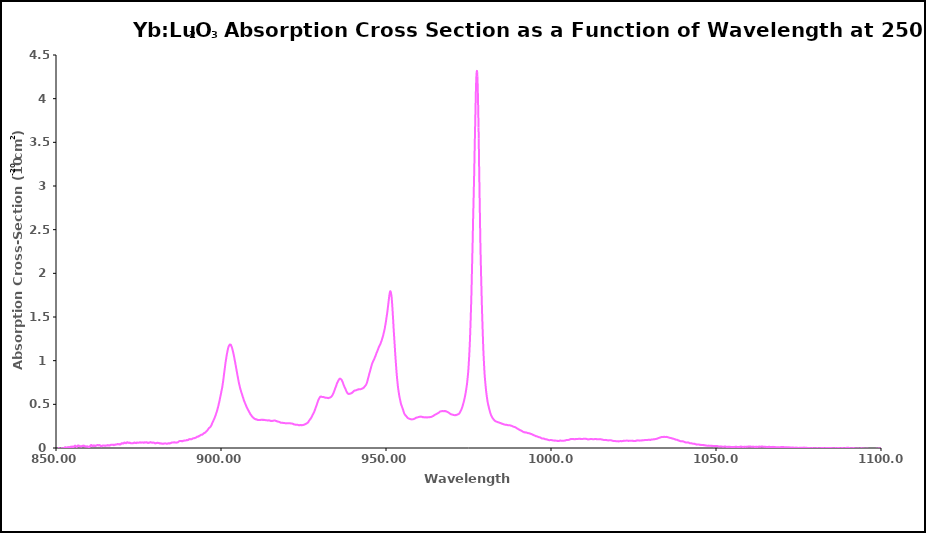
| Category | 250 K |
|---|---|
| 850.0 | -0.028 |
| 850.05 | -0.026 |
| 850.1 | -0.023 |
| 850.15 | -0.022 |
| 850.2 | -0.021 |
| 850.25 | -0.021 |
| 850.3 | -0.015 |
| 850.35 | -0.014 |
| 850.4 | -0.012 |
| 850.45 | -0.014 |
| 850.5 | -0.011 |
| 850.55 | -0.011 |
| 850.6 | -0.01 |
| 850.65 | -0.012 |
| 850.7 | -0.01 |
| 850.75 | -0.008 |
| 850.8 | -0.003 |
| 850.85 | -0.006 |
| 850.9 | -0.006 |
| 850.95 | -0.009 |
| 851.0 | -0.011 |
| 851.05 | -0.013 |
| 851.1 | -0.014 |
| 851.15 | -0.018 |
| 851.2 | -0.016 |
| 851.25 | -0.016 |
| 851.3 | -0.016 |
| 851.35 | -0.016 |
| 851.4 | -0.019 |
| 851.45 | -0.017 |
| 851.5 | -0.014 |
| 851.55 | -0.014 |
| 851.6 | -0.008 |
| 851.65 | -0.006 |
| 851.7 | -0.007 |
| 851.75 | -0.006 |
| 851.8 | -0.007 |
| 851.85 | -0.006 |
| 851.9 | -0.009 |
| 851.95 | -0.005 |
| 852.0 | -0.006 |
| 852.05 | -0.01 |
| 852.1 | -0.01 |
| 852.15 | -0.013 |
| 852.2 | -0.012 |
| 852.25 | -0.009 |
| 852.3 | -0.008 |
| 852.35 | -0.006 |
| 852.4 | -0.004 |
| 852.45 | -0.001 |
| 852.5 | -0.002 |
| 852.55 | -0.002 |
| 852.6 | 0.003 |
| 852.65 | 0.002 |
| 852.7 | 0.007 |
| 852.75 | 0.009 |
| 852.8 | 0.008 |
| 852.85 | 0.008 |
| 852.9 | 0.008 |
| 852.95 | 0.005 |
| 853.0 | 0.001 |
| 853.05 | -0.001 |
| 853.1 | 0.001 |
| 853.15 | 0 |
| 853.2 | 0.005 |
| 853.25 | 0.002 |
| 853.3 | -0.004 |
| 853.35 | -0.002 |
| 853.4 | 0 |
| 853.45 | -0.001 |
| 853.5 | 0 |
| 853.55 | 0.008 |
| 853.6 | 0.01 |
| 853.65 | 0.009 |
| 853.7 | 0.009 |
| 853.75 | 0.008 |
| 853.8 | 0.004 |
| 853.85 | 0.008 |
| 853.9 | 0.01 |
| 853.95 | 0.007 |
| 854.0 | 0.008 |
| 854.05 | 0.01 |
| 854.1 | 0.007 |
| 854.15 | 0.007 |
| 854.2 | 0.008 |
| 854.25 | 0.009 |
| 854.3 | 0.009 |
| 854.35 | 0.013 |
| 854.4 | 0.013 |
| 854.45 | 0.012 |
| 854.5 | 0.012 |
| 854.55 | 0.014 |
| 854.6 | 0.014 |
| 854.65 | 0.014 |
| 854.7 | 0.015 |
| 854.75 | 0.016 |
| 854.8 | 0.013 |
| 854.85 | 0.013 |
| 854.9 | 0.014 |
| 854.95 | 0.017 |
| 855.0 | 0.015 |
| 855.05 | 0.016 |
| 855.1 | 0.011 |
| 855.15 | 0.011 |
| 855.2 | 0.012 |
| 855.25 | 0.008 |
| 855.3 | 0.01 |
| 855.35 | 0.013 |
| 855.4 | 0.017 |
| 855.45 | 0.018 |
| 855.5 | 0.017 |
| 855.55 | 0.019 |
| 855.6 | 0.022 |
| 855.65 | 0.025 |
| 855.7 | 0.025 |
| 855.75 | 0.025 |
| 855.8 | 0.028 |
| 855.85 | 0.025 |
| 855.9 | 0.023 |
| 855.95 | 0.023 |
| 856.0 | 0.019 |
| 856.05 | 0.016 |
| 856.1 | 0.015 |
| 856.15 | 0.014 |
| 856.2 | 0.011 |
| 856.25 | 0.014 |
| 856.3 | 0.014 |
| 856.35 | 0.013 |
| 856.4 | 0.017 |
| 856.45 | 0.02 |
| 856.5 | 0.021 |
| 856.55 | 0.026 |
| 856.6 | 0.027 |
| 856.65 | 0.028 |
| 856.7 | 0.025 |
| 856.75 | 0.027 |
| 856.8 | 0.025 |
| 856.85 | 0.027 |
| 856.9 | 0.029 |
| 856.95 | 0.026 |
| 857.0 | 0.025 |
| 857.05 | 0.023 |
| 857.1 | 0.023 |
| 857.15 | 0.022 |
| 857.2 | 0.02 |
| 857.25 | 0.021 |
| 857.3 | 0.022 |
| 857.35 | 0.019 |
| 857.4 | 0.019 |
| 857.45 | 0.018 |
| 857.5 | 0.021 |
| 857.55 | 0.018 |
| 857.6 | 0.016 |
| 857.65 | 0.016 |
| 857.7 | 0.017 |
| 857.75 | 0.021 |
| 857.8 | 0.019 |
| 857.85 | 0.021 |
| 857.9 | 0.024 |
| 857.95 | 0.021 |
| 858.0 | 0.023 |
| 858.05 | 0.022 |
| 858.1 | 0.024 |
| 858.15 | 0.026 |
| 858.2 | 0.025 |
| 858.25 | 0.027 |
| 858.3 | 0.024 |
| 858.35 | 0.024 |
| 858.4 | 0.024 |
| 858.45 | 0.023 |
| 858.5 | 0.025 |
| 858.55 | 0.025 |
| 858.6 | 0.023 |
| 858.65 | 0.022 |
| 858.7 | 0.02 |
| 858.75 | 0.021 |
| 858.8 | 0.017 |
| 858.85 | 0.019 |
| 858.9 | 0.018 |
| 858.95 | 0.018 |
| 859.0 | 0.02 |
| 859.05 | 0.017 |
| 859.1 | 0.018 |
| 859.15 | 0.018 |
| 859.2 | 0.016 |
| 859.25 | 0.017 |
| 859.3 | 0.015 |
| 859.35 | 0.016 |
| 859.4 | 0.016 |
| 859.45 | 0.02 |
| 859.5 | 0.019 |
| 859.55 | 0.015 |
| 859.6 | 0.016 |
| 859.65 | 0.013 |
| 859.7 | 0.013 |
| 859.75 | 0.013 |
| 859.8 | 0.013 |
| 859.85 | 0.014 |
| 859.9 | 0.014 |
| 859.95 | 0.014 |
| 860.0 | 0.01 |
| 860.05 | 0.009 |
| 860.1 | 0.011 |
| 860.15 | 0.014 |
| 860.2 | 0.013 |
| 860.25 | 0.017 |
| 860.3 | 0.018 |
| 860.35 | 0.022 |
| 860.4 | 0.027 |
| 860.45 | 0.029 |
| 860.5 | 0.027 |
| 860.55 | 0.031 |
| 860.6 | 0.032 |
| 860.65 | 0.034 |
| 860.7 | 0.031 |
| 860.75 | 0.033 |
| 860.8 | 0.032 |
| 860.85 | 0.03 |
| 860.9 | 0.027 |
| 860.95 | 0.023 |
| 861.0 | 0.023 |
| 861.05 | 0.025 |
| 861.1 | 0.022 |
| 861.15 | 0.021 |
| 861.2 | 0.021 |
| 861.25 | 0.022 |
| 861.3 | 0.026 |
| 861.35 | 0.028 |
| 861.4 | 0.03 |
| 861.45 | 0.028 |
| 861.5 | 0.027 |
| 861.55 | 0.026 |
| 861.6 | 0.024 |
| 861.65 | 0.029 |
| 861.7 | 0.029 |
| 861.75 | 0.029 |
| 861.8 | 0.027 |
| 861.85 | 0.023 |
| 861.9 | 0.022 |
| 861.95 | 0.022 |
| 862.0 | 0.023 |
| 862.05 | 0.024 |
| 862.1 | 0.024 |
| 862.15 | 0.027 |
| 862.2 | 0.027 |
| 862.25 | 0.029 |
| 862.3 | 0.031 |
| 862.35 | 0.03 |
| 862.4 | 0.032 |
| 862.45 | 0.032 |
| 862.5 | 0.033 |
| 862.55 | 0.034 |
| 862.6 | 0.033 |
| 862.65 | 0.035 |
| 862.7 | 0.035 |
| 862.75 | 0.032 |
| 862.8 | 0.03 |
| 862.85 | 0.03 |
| 862.9 | 0.032 |
| 862.95 | 0.032 |
| 863.0 | 0.033 |
| 863.05 | 0.032 |
| 863.1 | 0.033 |
| 863.15 | 0.034 |
| 863.2 | 0.032 |
| 863.25 | 0.029 |
| 863.3 | 0.031 |
| 863.35 | 0.032 |
| 863.4 | 0.027 |
| 863.45 | 0.025 |
| 863.5 | 0.025 |
| 863.55 | 0.024 |
| 863.6 | 0.022 |
| 863.65 | 0.02 |
| 863.7 | 0.02 |
| 863.75 | 0.019 |
| 863.8 | 0.022 |
| 863.85 | 0.02 |
| 863.9 | 0.022 |
| 863.95 | 0.025 |
| 864.0 | 0.027 |
| 864.05 | 0.026 |
| 864.1 | 0.025 |
| 864.15 | 0.028 |
| 864.2 | 0.029 |
| 864.25 | 0.03 |
| 864.3 | 0.028 |
| 864.35 | 0.028 |
| 864.4 | 0.029 |
| 864.45 | 0.027 |
| 864.5 | 0.028 |
| 864.55 | 0.027 |
| 864.6 | 0.027 |
| 864.65 | 0.028 |
| 864.7 | 0.026 |
| 864.75 | 0.026 |
| 864.8 | 0.026 |
| 864.85 | 0.027 |
| 864.9 | 0.028 |
| 864.95 | 0.027 |
| 865.0 | 0.027 |
| 865.05 | 0.024 |
| 865.1 | 0.027 |
| 865.15 | 0.026 |
| 865.2 | 0.028 |
| 865.25 | 0.029 |
| 865.3 | 0.03 |
| 865.35 | 0.029 |
| 865.4 | 0.03 |
| 865.45 | 0.028 |
| 865.5 | 0.029 |
| 865.55 | 0.029 |
| 865.6 | 0.033 |
| 865.65 | 0.033 |
| 865.7 | 0.031 |
| 865.75 | 0.03 |
| 865.8 | 0.029 |
| 865.85 | 0.03 |
| 865.9 | 0.029 |
| 865.95 | 0.031 |
| 866.0 | 0.031 |
| 866.05 | 0.03 |
| 866.1 | 0.029 |
| 866.15 | 0.029 |
| 866.2 | 0.027 |
| 866.25 | 0.03 |
| 866.3 | 0.031 |
| 866.35 | 0.029 |
| 866.4 | 0.032 |
| 866.45 | 0.033 |
| 866.5 | 0.034 |
| 866.55 | 0.035 |
| 866.6 | 0.035 |
| 866.65 | 0.038 |
| 866.7 | 0.036 |
| 866.75 | 0.037 |
| 866.8 | 0.037 |
| 866.85 | 0.038 |
| 866.9 | 0.038 |
| 866.95 | 0.036 |
| 867.0 | 0.037 |
| 867.05 | 0.037 |
| 867.1 | 0.037 |
| 867.15 | 0.037 |
| 867.2 | 0.037 |
| 867.25 | 0.038 |
| 867.3 | 0.037 |
| 867.35 | 0.036 |
| 867.4 | 0.033 |
| 867.45 | 0.037 |
| 867.5 | 0.036 |
| 867.55 | 0.033 |
| 867.6 | 0.033 |
| 867.65 | 0.035 |
| 867.7 | 0.037 |
| 867.75 | 0.037 |
| 867.8 | 0.036 |
| 867.85 | 0.037 |
| 867.9 | 0.037 |
| 867.95 | 0.039 |
| 868.0 | 0.037 |
| 868.05 | 0.038 |
| 868.1 | 0.041 |
| 868.15 | 0.04 |
| 868.2 | 0.04 |
| 868.25 | 0.041 |
| 868.3 | 0.039 |
| 868.35 | 0.041 |
| 868.4 | 0.041 |
| 868.45 | 0.043 |
| 868.5 | 0.042 |
| 868.55 | 0.043 |
| 868.6 | 0.045 |
| 868.65 | 0.045 |
| 868.7 | 0.044 |
| 868.75 | 0.042 |
| 868.8 | 0.042 |
| 868.85 | 0.043 |
| 868.9 | 0.042 |
| 868.95 | 0.043 |
| 869.0 | 0.044 |
| 869.05 | 0.046 |
| 869.1 | 0.045 |
| 869.15 | 0.041 |
| 869.2 | 0.039 |
| 869.25 | 0.042 |
| 869.3 | 0.042 |
| 869.35 | 0.039 |
| 869.4 | 0.04 |
| 869.45 | 0.043 |
| 869.5 | 0.043 |
| 869.55 | 0.041 |
| 869.6 | 0.042 |
| 869.65 | 0.044 |
| 869.7 | 0.047 |
| 869.75 | 0.05 |
| 869.8 | 0.05 |
| 869.85 | 0.054 |
| 869.9 | 0.055 |
| 869.95 | 0.054 |
| 870.0 | 0.053 |
| 870.05 | 0.051 |
| 870.1 | 0.052 |
| 870.15 | 0.054 |
| 870.2 | 0.052 |
| 870.25 | 0.052 |
| 870.3 | 0.054 |
| 870.35 | 0.054 |
| 870.4 | 0.051 |
| 870.45 | 0.052 |
| 870.5 | 0.054 |
| 870.55 | 0.056 |
| 870.6 | 0.06 |
| 870.65 | 0.062 |
| 870.7 | 0.06 |
| 870.75 | 0.062 |
| 870.8 | 0.062 |
| 870.85 | 0.059 |
| 870.9 | 0.057 |
| 870.95 | 0.061 |
| 871.0 | 0.06 |
| 871.05 | 0.059 |
| 871.1 | 0.057 |
| 871.15 | 0.056 |
| 871.2 | 0.055 |
| 871.25 | 0.055 |
| 871.3 | 0.057 |
| 871.35 | 0.057 |
| 871.4 | 0.061 |
| 871.45 | 0.063 |
| 871.5 | 0.061 |
| 871.55 | 0.064 |
| 871.6 | 0.065 |
| 871.65 | 0.067 |
| 871.7 | 0.062 |
| 871.75 | 0.062 |
| 871.8 | 0.06 |
| 871.85 | 0.062 |
| 871.9 | 0.062 |
| 871.95 | 0.059 |
| 872.0 | 0.059 |
| 872.05 | 0.06 |
| 872.1 | 0.058 |
| 872.15 | 0.058 |
| 872.2 | 0.058 |
| 872.25 | 0.06 |
| 872.3 | 0.06 |
| 872.35 | 0.062 |
| 872.4 | 0.059 |
| 872.45 | 0.059 |
| 872.5 | 0.059 |
| 872.55 | 0.056 |
| 872.6 | 0.055 |
| 872.65 | 0.055 |
| 872.7 | 0.055 |
| 872.75 | 0.054 |
| 872.8 | 0.056 |
| 872.85 | 0.055 |
| 872.9 | 0.055 |
| 872.95 | 0.056 |
| 873.0 | 0.055 |
| 873.05 | 0.054 |
| 873.1 | 0.055 |
| 873.15 | 0.055 |
| 873.2 | 0.055 |
| 873.25 | 0.055 |
| 873.3 | 0.056 |
| 873.35 | 0.055 |
| 873.4 | 0.057 |
| 873.45 | 0.056 |
| 873.5 | 0.056 |
| 873.55 | 0.058 |
| 873.6 | 0.059 |
| 873.65 | 0.062 |
| 873.7 | 0.061 |
| 873.75 | 0.063 |
| 873.8 | 0.064 |
| 873.85 | 0.062 |
| 873.9 | 0.06 |
| 873.95 | 0.058 |
| 874.0 | 0.058 |
| 874.05 | 0.06 |
| 874.1 | 0.058 |
| 874.15 | 0.058 |
| 874.2 | 0.057 |
| 874.25 | 0.057 |
| 874.3 | 0.056 |
| 874.35 | 0.056 |
| 874.4 | 0.057 |
| 874.45 | 0.061 |
| 874.5 | 0.062 |
| 874.55 | 0.062 |
| 874.6 | 0.06 |
| 874.65 | 0.062 |
| 874.7 | 0.061 |
| 874.75 | 0.061 |
| 874.8 | 0.06 |
| 874.85 | 0.061 |
| 874.9 | 0.059 |
| 874.95 | 0.06 |
| 875.0 | 0.059 |
| 875.05 | 0.06 |
| 875.1 | 0.06 |
| 875.15 | 0.061 |
| 875.2 | 0.062 |
| 875.25 | 0.063 |
| 875.3 | 0.063 |
| 875.35 | 0.064 |
| 875.4 | 0.064 |
| 875.45 | 0.065 |
| 875.5 | 0.065 |
| 875.55 | 0.065 |
| 875.6 | 0.063 |
| 875.65 | 0.064 |
| 875.7 | 0.061 |
| 875.75 | 0.061 |
| 875.8 | 0.061 |
| 875.85 | 0.061 |
| 875.9 | 0.062 |
| 875.95 | 0.063 |
| 876.0 | 0.063 |
| 876.05 | 0.064 |
| 876.1 | 0.063 |
| 876.15 | 0.065 |
| 876.2 | 0.062 |
| 876.25 | 0.063 |
| 876.3 | 0.062 |
| 876.35 | 0.063 |
| 876.4 | 0.062 |
| 876.45 | 0.061 |
| 876.5 | 0.061 |
| 876.55 | 0.062 |
| 876.6 | 0.061 |
| 876.65 | 0.061 |
| 876.7 | 0.06 |
| 876.75 | 0.064 |
| 876.8 | 0.064 |
| 876.85 | 0.065 |
| 876.9 | 0.064 |
| 876.95 | 0.062 |
| 877.0 | 0.063 |
| 877.05 | 0.063 |
| 877.1 | 0.062 |
| 877.15 | 0.062 |
| 877.2 | 0.064 |
| 877.25 | 0.066 |
| 877.3 | 0.064 |
| 877.35 | 0.064 |
| 877.4 | 0.062 |
| 877.45 | 0.063 |
| 877.5 | 0.066 |
| 877.55 | 0.064 |
| 877.6 | 0.063 |
| 877.65 | 0.062 |
| 877.7 | 0.061 |
| 877.75 | 0.059 |
| 877.8 | 0.059 |
| 877.85 | 0.061 |
| 877.9 | 0.061 |
| 877.95 | 0.059 |
| 878.0 | 0.059 |
| 878.05 | 0.058 |
| 878.1 | 0.058 |
| 878.15 | 0.06 |
| 878.2 | 0.061 |
| 878.25 | 0.062 |
| 878.3 | 0.064 |
| 878.35 | 0.064 |
| 878.4 | 0.064 |
| 878.45 | 0.061 |
| 878.5 | 0.064 |
| 878.55 | 0.064 |
| 878.6 | 0.065 |
| 878.65 | 0.068 |
| 878.7 | 0.066 |
| 878.75 | 0.064 |
| 878.8 | 0.064 |
| 878.85 | 0.063 |
| 878.9 | 0.063 |
| 878.95 | 0.061 |
| 879.0 | 0.062 |
| 879.05 | 0.062 |
| 879.1 | 0.062 |
| 879.15 | 0.062 |
| 879.2 | 0.06 |
| 879.25 | 0.06 |
| 879.3 | 0.061 |
| 879.35 | 0.061 |
| 879.4 | 0.062 |
| 879.45 | 0.063 |
| 879.5 | 0.063 |
| 879.55 | 0.062 |
| 879.6 | 0.061 |
| 879.65 | 0.061 |
| 879.7 | 0.061 |
| 879.75 | 0.06 |
| 879.8 | 0.059 |
| 879.85 | 0.059 |
| 879.9 | 0.057 |
| 879.95 | 0.055 |
| 880.0 | 0.053 |
| 880.05 | 0.054 |
| 880.1 | 0.055 |
| 880.15 | 0.054 |
| 880.2 | 0.054 |
| 880.25 | 0.052 |
| 880.3 | 0.055 |
| 880.35 | 0.057 |
| 880.4 | 0.057 |
| 880.45 | 0.058 |
| 880.5 | 0.058 |
| 880.55 | 0.059 |
| 880.6 | 0.057 |
| 880.65 | 0.058 |
| 880.7 | 0.06 |
| 880.75 | 0.059 |
| 880.8 | 0.06 |
| 880.85 | 0.06 |
| 880.9 | 0.058 |
| 880.95 | 0.058 |
| 881.0 | 0.056 |
| 881.05 | 0.056 |
| 881.1 | 0.057 |
| 881.15 | 0.057 |
| 881.2 | 0.056 |
| 881.25 | 0.055 |
| 881.3 | 0.056 |
| 881.35 | 0.053 |
| 881.4 | 0.052 |
| 881.45 | 0.051 |
| 881.5 | 0.052 |
| 881.55 | 0.052 |
| 881.6 | 0.053 |
| 881.65 | 0.053 |
| 881.7 | 0.054 |
| 881.75 | 0.053 |
| 881.8 | 0.052 |
| 881.85 | 0.051 |
| 881.9 | 0.053 |
| 881.95 | 0.053 |
| 882.0 | 0.053 |
| 882.05 | 0.05 |
| 882.1 | 0.051 |
| 882.15 | 0.051 |
| 882.2 | 0.049 |
| 882.25 | 0.05 |
| 882.3 | 0.049 |
| 882.35 | 0.05 |
| 882.4 | 0.05 |
| 882.45 | 0.049 |
| 882.5 | 0.049 |
| 882.55 | 0.049 |
| 882.6 | 0.051 |
| 882.65 | 0.051 |
| 882.7 | 0.051 |
| 882.75 | 0.051 |
| 882.8 | 0.051 |
| 882.85 | 0.052 |
| 882.9 | 0.051 |
| 882.95 | 0.053 |
| 883.0 | 0.053 |
| 883.05 | 0.054 |
| 883.1 | 0.054 |
| 883.15 | 0.053 |
| 883.2 | 0.052 |
| 883.25 | 0.051 |
| 883.3 | 0.052 |
| 883.35 | 0.051 |
| 883.4 | 0.05 |
| 883.45 | 0.05 |
| 883.5 | 0.05 |
| 883.55 | 0.048 |
| 883.6 | 0.049 |
| 883.65 | 0.048 |
| 883.7 | 0.048 |
| 883.75 | 0.049 |
| 883.8 | 0.051 |
| 883.85 | 0.052 |
| 883.9 | 0.052 |
| 883.95 | 0.053 |
| 884.0 | 0.052 |
| 884.05 | 0.052 |
| 884.1 | 0.054 |
| 884.15 | 0.053 |
| 884.2 | 0.054 |
| 884.25 | 0.054 |
| 884.3 | 0.056 |
| 884.35 | 0.054 |
| 884.4 | 0.051 |
| 884.45 | 0.051 |
| 884.5 | 0.052 |
| 884.55 | 0.053 |
| 884.6 | 0.053 |
| 884.65 | 0.054 |
| 884.7 | 0.057 |
| 884.75 | 0.058 |
| 884.8 | 0.059 |
| 884.85 | 0.057 |
| 884.9 | 0.058 |
| 884.95 | 0.06 |
| 885.0 | 0.062 |
| 885.05 | 0.062 |
| 885.1 | 0.062 |
| 885.15 | 0.062 |
| 885.2 | 0.064 |
| 885.25 | 0.062 |
| 885.3 | 0.062 |
| 885.35 | 0.062 |
| 885.4 | 0.064 |
| 885.45 | 0.064 |
| 885.5 | 0.063 |
| 885.55 | 0.062 |
| 885.6 | 0.063 |
| 885.65 | 0.065 |
| 885.7 | 0.064 |
| 885.75 | 0.062 |
| 885.8 | 0.063 |
| 885.85 | 0.066 |
| 885.9 | 0.066 |
| 885.95 | 0.063 |
| 886.0 | 0.063 |
| 886.05 | 0.062 |
| 886.1 | 0.063 |
| 886.15 | 0.062 |
| 886.2 | 0.062 |
| 886.25 | 0.063 |
| 886.3 | 0.063 |
| 886.35 | 0.061 |
| 886.4 | 0.061 |
| 886.45 | 0.061 |
| 886.5 | 0.062 |
| 886.55 | 0.062 |
| 886.6 | 0.063 |
| 886.65 | 0.063 |
| 886.7 | 0.062 |
| 886.75 | 0.063 |
| 886.8 | 0.064 |
| 886.85 | 0.064 |
| 886.9 | 0.066 |
| 886.95 | 0.066 |
| 887.0 | 0.068 |
| 887.05 | 0.069 |
| 887.1 | 0.071 |
| 887.15 | 0.073 |
| 887.2 | 0.075 |
| 887.25 | 0.075 |
| 887.3 | 0.077 |
| 887.35 | 0.077 |
| 887.4 | 0.078 |
| 887.45 | 0.079 |
| 887.5 | 0.079 |
| 887.55 | 0.079 |
| 887.6 | 0.079 |
| 887.65 | 0.079 |
| 887.7 | 0.079 |
| 887.75 | 0.08 |
| 887.8 | 0.081 |
| 887.85 | 0.079 |
| 887.9 | 0.08 |
| 887.95 | 0.08 |
| 888.0 | 0.079 |
| 888.05 | 0.078 |
| 888.1 | 0.079 |
| 888.15 | 0.08 |
| 888.2 | 0.081 |
| 888.25 | 0.08 |
| 888.3 | 0.077 |
| 888.35 | 0.077 |
| 888.4 | 0.079 |
| 888.45 | 0.08 |
| 888.5 | 0.08 |
| 888.55 | 0.081 |
| 888.6 | 0.083 |
| 888.65 | 0.083 |
| 888.7 | 0.083 |
| 888.75 | 0.083 |
| 888.8 | 0.083 |
| 888.85 | 0.085 |
| 888.9 | 0.085 |
| 888.95 | 0.086 |
| 889.0 | 0.084 |
| 889.05 | 0.085 |
| 889.1 | 0.086 |
| 889.15 | 0.086 |
| 889.2 | 0.085 |
| 889.25 | 0.085 |
| 889.3 | 0.085 |
| 889.35 | 0.087 |
| 889.4 | 0.087 |
| 889.45 | 0.089 |
| 889.5 | 0.09 |
| 889.55 | 0.091 |
| 889.6 | 0.09 |
| 889.65 | 0.089 |
| 889.7 | 0.089 |
| 889.75 | 0.088 |
| 889.8 | 0.09 |
| 889.85 | 0.091 |
| 889.9 | 0.091 |
| 889.95 | 0.092 |
| 890.0 | 0.092 |
| 890.05 | 0.092 |
| 890.1 | 0.092 |
| 890.15 | 0.096 |
| 890.2 | 0.096 |
| 890.25 | 0.098 |
| 890.3 | 0.1 |
| 890.35 | 0.1 |
| 890.4 | 0.101 |
| 890.45 | 0.101 |
| 890.5 | 0.101 |
| 890.55 | 0.103 |
| 890.6 | 0.102 |
| 890.65 | 0.103 |
| 890.7 | 0.1 |
| 890.75 | 0.101 |
| 890.8 | 0.101 |
| 890.85 | 0.1 |
| 890.9 | 0.101 |
| 890.95 | 0.101 |
| 891.0 | 0.1 |
| 891.05 | 0.101 |
| 891.1 | 0.101 |
| 891.15 | 0.101 |
| 891.2 | 0.103 |
| 891.25 | 0.105 |
| 891.3 | 0.105 |
| 891.35 | 0.106 |
| 891.4 | 0.109 |
| 891.45 | 0.11 |
| 891.5 | 0.11 |
| 891.55 | 0.111 |
| 891.6 | 0.111 |
| 891.65 | 0.111 |
| 891.7 | 0.111 |
| 891.75 | 0.111 |
| 891.8 | 0.112 |
| 891.85 | 0.113 |
| 891.9 | 0.113 |
| 891.95 | 0.114 |
| 892.0 | 0.113 |
| 892.05 | 0.114 |
| 892.1 | 0.115 |
| 892.15 | 0.114 |
| 892.2 | 0.116 |
| 892.25 | 0.117 |
| 892.3 | 0.117 |
| 892.35 | 0.119 |
| 892.4 | 0.12 |
| 892.45 | 0.12 |
| 892.5 | 0.12 |
| 892.55 | 0.121 |
| 892.6 | 0.124 |
| 892.65 | 0.127 |
| 892.7 | 0.129 |
| 892.75 | 0.128 |
| 892.8 | 0.128 |
| 892.85 | 0.129 |
| 892.9 | 0.128 |
| 892.95 | 0.129 |
| 893.0 | 0.132 |
| 893.05 | 0.132 |
| 893.1 | 0.133 |
| 893.15 | 0.134 |
| 893.2 | 0.132 |
| 893.25 | 0.133 |
| 893.3 | 0.135 |
| 893.35 | 0.138 |
| 893.4 | 0.139 |
| 893.45 | 0.14 |
| 893.5 | 0.139 |
| 893.55 | 0.14 |
| 893.6 | 0.142 |
| 893.65 | 0.144 |
| 893.7 | 0.144 |
| 893.75 | 0.145 |
| 893.8 | 0.147 |
| 893.85 | 0.148 |
| 893.9 | 0.15 |
| 893.95 | 0.15 |
| 894.0 | 0.151 |
| 894.05 | 0.152 |
| 894.1 | 0.152 |
| 894.15 | 0.151 |
| 894.2 | 0.152 |
| 894.25 | 0.152 |
| 894.3 | 0.154 |
| 894.35 | 0.154 |
| 894.4 | 0.154 |
| 894.45 | 0.156 |
| 894.5 | 0.157 |
| 894.55 | 0.159 |
| 894.6 | 0.162 |
| 894.65 | 0.164 |
| 894.7 | 0.167 |
| 894.75 | 0.168 |
| 894.8 | 0.169 |
| 894.85 | 0.169 |
| 894.9 | 0.17 |
| 894.95 | 0.171 |
| 895.0 | 0.173 |
| 895.05 | 0.172 |
| 895.1 | 0.174 |
| 895.15 | 0.176 |
| 895.2 | 0.177 |
| 895.25 | 0.178 |
| 895.3 | 0.179 |
| 895.35 | 0.182 |
| 895.4 | 0.185 |
| 895.45 | 0.186 |
| 895.5 | 0.189 |
| 895.55 | 0.189 |
| 895.6 | 0.192 |
| 895.65 | 0.194 |
| 895.7 | 0.195 |
| 895.75 | 0.196 |
| 895.8 | 0.198 |
| 895.85 | 0.2 |
| 895.9 | 0.203 |
| 895.95 | 0.206 |
| 896.0 | 0.209 |
| 896.05 | 0.211 |
| 896.1 | 0.215 |
| 896.15 | 0.218 |
| 896.2 | 0.219 |
| 896.25 | 0.222 |
| 896.3 | 0.225 |
| 896.35 | 0.227 |
| 896.4 | 0.231 |
| 896.45 | 0.231 |
| 896.5 | 0.232 |
| 896.55 | 0.234 |
| 896.6 | 0.235 |
| 896.65 | 0.237 |
| 896.7 | 0.239 |
| 896.75 | 0.24 |
| 896.8 | 0.243 |
| 896.85 | 0.245 |
| 896.9 | 0.248 |
| 896.95 | 0.251 |
| 897.0 | 0.255 |
| 897.05 | 0.258 |
| 897.1 | 0.262 |
| 897.15 | 0.266 |
| 897.2 | 0.271 |
| 897.25 | 0.277 |
| 897.3 | 0.282 |
| 897.35 | 0.285 |
| 897.4 | 0.289 |
| 897.45 | 0.294 |
| 897.5 | 0.298 |
| 897.55 | 0.301 |
| 897.6 | 0.305 |
| 897.65 | 0.31 |
| 897.7 | 0.315 |
| 897.75 | 0.319 |
| 897.8 | 0.322 |
| 897.85 | 0.325 |
| 897.9 | 0.331 |
| 897.95 | 0.336 |
| 898.0 | 0.339 |
| 898.05 | 0.343 |
| 898.1 | 0.349 |
| 898.15 | 0.353 |
| 898.2 | 0.359 |
| 898.25 | 0.363 |
| 898.3 | 0.368 |
| 898.35 | 0.373 |
| 898.4 | 0.378 |
| 898.45 | 0.384 |
| 898.5 | 0.39 |
| 898.55 | 0.396 |
| 898.6 | 0.402 |
| 898.65 | 0.408 |
| 898.7 | 0.415 |
| 898.75 | 0.419 |
| 898.8 | 0.426 |
| 898.85 | 0.432 |
| 898.9 | 0.44 |
| 898.95 | 0.447 |
| 899.0 | 0.454 |
| 899.05 | 0.46 |
| 899.1 | 0.467 |
| 899.15 | 0.475 |
| 899.2 | 0.483 |
| 899.25 | 0.491 |
| 899.3 | 0.501 |
| 899.35 | 0.51 |
| 899.4 | 0.516 |
| 899.45 | 0.523 |
| 899.5 | 0.532 |
| 899.55 | 0.539 |
| 899.6 | 0.548 |
| 899.65 | 0.56 |
| 899.7 | 0.569 |
| 899.75 | 0.58 |
| 899.8 | 0.588 |
| 899.85 | 0.596 |
| 899.9 | 0.605 |
| 899.95 | 0.615 |
| 900.0 | 0.625 |
| 900.05 | 0.634 |
| 900.1 | 0.645 |
| 900.15 | 0.653 |
| 900.2 | 0.662 |
| 900.25 | 0.671 |
| 900.3 | 0.68 |
| 900.35 | 0.691 |
| 900.4 | 0.701 |
| 900.45 | 0.714 |
| 900.5 | 0.727 |
| 900.55 | 0.739 |
| 900.6 | 0.751 |
| 900.65 | 0.765 |
| 900.7 | 0.78 |
| 900.75 | 0.795 |
| 900.8 | 0.808 |
| 900.85 | 0.824 |
| 900.9 | 0.84 |
| 900.95 | 0.855 |
| 901.0 | 0.869 |
| 901.05 | 0.884 |
| 901.1 | 0.898 |
| 901.15 | 0.911 |
| 901.2 | 0.927 |
| 901.25 | 0.941 |
| 901.3 | 0.957 |
| 901.35 | 0.972 |
| 901.4 | 0.984 |
| 901.45 | 0.996 |
| 901.5 | 1.008 |
| 901.55 | 1.02 |
| 901.6 | 1.031 |
| 901.65 | 1.044 |
| 901.7 | 1.056 |
| 901.75 | 1.067 |
| 901.8 | 1.077 |
| 901.85 | 1.087 |
| 901.9 | 1.096 |
| 901.95 | 1.106 |
| 902.0 | 1.116 |
| 902.05 | 1.126 |
| 902.1 | 1.133 |
| 902.15 | 1.141 |
| 902.2 | 1.148 |
| 902.25 | 1.155 |
| 902.3 | 1.161 |
| 902.35 | 1.165 |
| 902.4 | 1.168 |
| 902.45 | 1.172 |
| 902.5 | 1.174 |
| 902.55 | 1.177 |
| 902.6 | 1.181 |
| 902.65 | 1.184 |
| 902.7 | 1.184 |
| 902.75 | 1.185 |
| 902.8 | 1.182 |
| 902.85 | 1.182 |
| 902.9 | 1.184 |
| 902.95 | 1.182 |
| 903.0 | 1.179 |
| 903.05 | 1.177 |
| 903.1 | 1.172 |
| 903.15 | 1.167 |
| 903.2 | 1.162 |
| 903.25 | 1.158 |
| 903.3 | 1.152 |
| 903.35 | 1.146 |
| 903.4 | 1.139 |
| 903.45 | 1.131 |
| 903.5 | 1.124 |
| 903.55 | 1.118 |
| 903.6 | 1.109 |
| 903.65 | 1.102 |
| 903.7 | 1.093 |
| 903.75 | 1.084 |
| 903.8 | 1.075 |
| 903.85 | 1.067 |
| 903.9 | 1.059 |
| 903.95 | 1.049 |
| 904.0 | 1.039 |
| 904.05 | 1.029 |
| 904.1 | 1.018 |
| 904.15 | 1.009 |
| 904.2 | 0.999 |
| 904.25 | 0.989 |
| 904.3 | 0.98 |
| 904.35 | 0.968 |
| 904.4 | 0.957 |
| 904.45 | 0.947 |
| 904.5 | 0.936 |
| 904.55 | 0.926 |
| 904.6 | 0.916 |
| 904.65 | 0.906 |
| 904.7 | 0.894 |
| 904.75 | 0.884 |
| 904.8 | 0.875 |
| 904.85 | 0.862 |
| 904.9 | 0.853 |
| 904.95 | 0.842 |
| 905.0 | 0.831 |
| 905.05 | 0.821 |
| 905.1 | 0.811 |
| 905.15 | 0.801 |
| 905.2 | 0.791 |
| 905.25 | 0.781 |
| 905.3 | 0.771 |
| 905.35 | 0.76 |
| 905.4 | 0.751 |
| 905.45 | 0.742 |
| 905.5 | 0.733 |
| 905.55 | 0.725 |
| 905.6 | 0.717 |
| 905.65 | 0.71 |
| 905.7 | 0.701 |
| 905.75 | 0.693 |
| 905.8 | 0.686 |
| 905.85 | 0.678 |
| 905.9 | 0.673 |
| 905.95 | 0.666 |
| 906.0 | 0.659 |
| 906.05 | 0.653 |
| 906.1 | 0.646 |
| 906.15 | 0.64 |
| 906.2 | 0.633 |
| 906.25 | 0.628 |
| 906.3 | 0.622 |
| 906.35 | 0.616 |
| 906.4 | 0.611 |
| 906.45 | 0.604 |
| 906.5 | 0.599 |
| 906.55 | 0.593 |
| 906.6 | 0.586 |
| 906.65 | 0.58 |
| 906.7 | 0.575 |
| 906.75 | 0.57 |
| 906.8 | 0.563 |
| 906.85 | 0.558 |
| 906.9 | 0.551 |
| 906.95 | 0.545 |
| 907.0 | 0.54 |
| 907.05 | 0.534 |
| 907.1 | 0.531 |
| 907.15 | 0.527 |
| 907.2 | 0.522 |
| 907.25 | 0.515 |
| 907.3 | 0.512 |
| 907.35 | 0.508 |
| 907.4 | 0.503 |
| 907.45 | 0.499 |
| 907.5 | 0.495 |
| 907.55 | 0.49 |
| 907.6 | 0.485 |
| 907.65 | 0.479 |
| 907.7 | 0.474 |
| 907.75 | 0.47 |
| 907.8 | 0.467 |
| 907.85 | 0.462 |
| 907.9 | 0.459 |
| 907.95 | 0.456 |
| 908.0 | 0.451 |
| 908.05 | 0.448 |
| 908.1 | 0.443 |
| 908.15 | 0.44 |
| 908.2 | 0.438 |
| 908.25 | 0.434 |
| 908.3 | 0.431 |
| 908.35 | 0.429 |
| 908.4 | 0.423 |
| 908.45 | 0.418 |
| 908.5 | 0.414 |
| 908.55 | 0.412 |
| 908.6 | 0.408 |
| 908.65 | 0.406 |
| 908.7 | 0.403 |
| 908.75 | 0.399 |
| 908.8 | 0.396 |
| 908.85 | 0.392 |
| 908.9 | 0.387 |
| 908.95 | 0.385 |
| 909.0 | 0.384 |
| 909.05 | 0.381 |
| 909.1 | 0.378 |
| 909.15 | 0.375 |
| 909.2 | 0.373 |
| 909.25 | 0.37 |
| 909.3 | 0.367 |
| 909.35 | 0.363 |
| 909.4 | 0.362 |
| 909.45 | 0.36 |
| 909.5 | 0.359 |
| 909.55 | 0.356 |
| 909.6 | 0.354 |
| 909.65 | 0.352 |
| 909.7 | 0.349 |
| 909.75 | 0.346 |
| 909.8 | 0.345 |
| 909.85 | 0.344 |
| 909.9 | 0.344 |
| 909.95 | 0.342 |
| 910.0 | 0.34 |
| 910.05 | 0.338 |
| 910.1 | 0.336 |
| 910.15 | 0.334 |
| 910.2 | 0.333 |
| 910.25 | 0.333 |
| 910.3 | 0.333 |
| 910.35 | 0.332 |
| 910.4 | 0.33 |
| 910.45 | 0.329 |
| 910.5 | 0.329 |
| 910.55 | 0.328 |
| 910.6 | 0.327 |
| 910.65 | 0.328 |
| 910.7 | 0.329 |
| 910.75 | 0.328 |
| 910.8 | 0.327 |
| 910.85 | 0.326 |
| 910.9 | 0.326 |
| 910.95 | 0.325 |
| 911.0 | 0.325 |
| 911.05 | 0.322 |
| 911.1 | 0.322 |
| 911.15 | 0.322 |
| 911.2 | 0.321 |
| 911.25 | 0.32 |
| 911.3 | 0.32 |
| 911.35 | 0.32 |
| 911.4 | 0.319 |
| 911.45 | 0.32 |
| 911.5 | 0.32 |
| 911.55 | 0.319 |
| 911.6 | 0.321 |
| 911.65 | 0.32 |
| 911.7 | 0.32 |
| 911.75 | 0.32 |
| 911.8 | 0.32 |
| 911.85 | 0.322 |
| 911.9 | 0.322 |
| 911.95 | 0.321 |
| 912.0 | 0.321 |
| 912.05 | 0.322 |
| 912.1 | 0.323 |
| 912.15 | 0.323 |
| 912.2 | 0.323 |
| 912.25 | 0.323 |
| 912.3 | 0.322 |
| 912.35 | 0.324 |
| 912.4 | 0.322 |
| 912.45 | 0.321 |
| 912.5 | 0.323 |
| 912.55 | 0.323 |
| 912.6 | 0.323 |
| 912.65 | 0.322 |
| 912.7 | 0.323 |
| 912.75 | 0.321 |
| 912.8 | 0.321 |
| 912.85 | 0.321 |
| 912.9 | 0.321 |
| 912.95 | 0.321 |
| 913.0 | 0.323 |
| 913.05 | 0.322 |
| 913.1 | 0.322 |
| 913.15 | 0.321 |
| 913.2 | 0.32 |
| 913.25 | 0.319 |
| 913.3 | 0.32 |
| 913.35 | 0.32 |
| 913.4 | 0.32 |
| 913.45 | 0.319 |
| 913.5 | 0.318 |
| 913.55 | 0.318 |
| 913.6 | 0.318 |
| 913.65 | 0.318 |
| 913.7 | 0.318 |
| 913.75 | 0.318 |
| 913.8 | 0.317 |
| 913.85 | 0.317 |
| 913.9 | 0.317 |
| 913.95 | 0.317 |
| 914.0 | 0.317 |
| 914.05 | 0.317 |
| 914.1 | 0.315 |
| 914.15 | 0.315 |
| 914.2 | 0.314 |
| 914.25 | 0.314 |
| 914.3 | 0.315 |
| 914.35 | 0.316 |
| 914.4 | 0.317 |
| 914.45 | 0.318 |
| 914.5 | 0.317 |
| 914.55 | 0.317 |
| 914.6 | 0.316 |
| 914.65 | 0.316 |
| 914.7 | 0.316 |
| 914.75 | 0.316 |
| 914.8 | 0.315 |
| 914.85 | 0.315 |
| 914.9 | 0.313 |
| 914.95 | 0.312 |
| 915.0 | 0.31 |
| 915.05 | 0.31 |
| 915.1 | 0.309 |
| 915.15 | 0.31 |
| 915.2 | 0.311 |
| 915.25 | 0.311 |
| 915.3 | 0.31 |
| 915.35 | 0.31 |
| 915.4 | 0.31 |
| 915.45 | 0.309 |
| 915.5 | 0.309 |
| 915.55 | 0.309 |
| 915.6 | 0.31 |
| 915.65 | 0.312 |
| 915.7 | 0.312 |
| 915.75 | 0.312 |
| 915.8 | 0.312 |
| 915.85 | 0.313 |
| 915.9 | 0.313 |
| 915.95 | 0.313 |
| 916.0 | 0.314 |
| 916.05 | 0.315 |
| 916.1 | 0.315 |
| 916.15 | 0.314 |
| 916.2 | 0.313 |
| 916.25 | 0.314 |
| 916.3 | 0.314 |
| 916.35 | 0.314 |
| 916.4 | 0.314 |
| 916.45 | 0.313 |
| 916.5 | 0.313 |
| 916.55 | 0.312 |
| 916.6 | 0.31 |
| 916.65 | 0.31 |
| 916.7 | 0.31 |
| 916.75 | 0.31 |
| 916.8 | 0.309 |
| 916.85 | 0.306 |
| 916.9 | 0.306 |
| 916.95 | 0.305 |
| 917.0 | 0.305 |
| 917.05 | 0.304 |
| 917.1 | 0.304 |
| 917.15 | 0.304 |
| 917.2 | 0.303 |
| 917.25 | 0.303 |
| 917.3 | 0.302 |
| 917.35 | 0.3 |
| 917.4 | 0.301 |
| 917.45 | 0.3 |
| 917.5 | 0.299 |
| 917.55 | 0.3 |
| 917.6 | 0.299 |
| 917.65 | 0.298 |
| 917.7 | 0.298 |
| 917.75 | 0.297 |
| 917.8 | 0.296 |
| 917.85 | 0.294 |
| 917.9 | 0.294 |
| 917.95 | 0.294 |
| 918.0 | 0.292 |
| 918.05 | 0.29 |
| 918.1 | 0.289 |
| 918.15 | 0.288 |
| 918.2 | 0.289 |
| 918.25 | 0.29 |
| 918.3 | 0.289 |
| 918.35 | 0.289 |
| 918.4 | 0.29 |
| 918.45 | 0.29 |
| 918.5 | 0.288 |
| 918.55 | 0.289 |
| 918.6 | 0.29 |
| 918.65 | 0.289 |
| 918.7 | 0.289 |
| 918.75 | 0.288 |
| 918.8 | 0.287 |
| 918.85 | 0.287 |
| 918.9 | 0.286 |
| 918.95 | 0.286 |
| 919.0 | 0.285 |
| 919.05 | 0.286 |
| 919.1 | 0.286 |
| 919.15 | 0.286 |
| 919.2 | 0.286 |
| 919.25 | 0.285 |
| 919.3 | 0.285 |
| 919.35 | 0.285 |
| 919.4 | 0.284 |
| 919.45 | 0.284 |
| 919.5 | 0.284 |
| 919.55 | 0.284 |
| 919.6 | 0.284 |
| 919.65 | 0.283 |
| 919.7 | 0.281 |
| 919.75 | 0.283 |
| 919.8 | 0.282 |
| 919.85 | 0.283 |
| 919.9 | 0.283 |
| 919.95 | 0.283 |
| 920.0 | 0.283 |
| 920.05 | 0.283 |
| 920.1 | 0.283 |
| 920.15 | 0.284 |
| 920.2 | 0.284 |
| 920.25 | 0.284 |
| 920.3 | 0.283 |
| 920.35 | 0.283 |
| 920.4 | 0.283 |
| 920.45 | 0.283 |
| 920.5 | 0.284 |
| 920.55 | 0.284 |
| 920.6 | 0.284 |
| 920.65 | 0.283 |
| 920.7 | 0.282 |
| 920.75 | 0.283 |
| 920.8 | 0.283 |
| 920.85 | 0.283 |
| 920.9 | 0.284 |
| 920.95 | 0.282 |
| 921.0 | 0.283 |
| 921.05 | 0.282 |
| 921.1 | 0.281 |
| 921.15 | 0.281 |
| 921.2 | 0.281 |
| 921.25 | 0.281 |
| 921.3 | 0.279 |
| 921.35 | 0.28 |
| 921.4 | 0.279 |
| 921.45 | 0.281 |
| 921.5 | 0.282 |
| 921.55 | 0.279 |
| 921.6 | 0.279 |
| 921.65 | 0.278 |
| 921.7 | 0.277 |
| 921.75 | 0.276 |
| 921.8 | 0.276 |
| 921.85 | 0.276 |
| 921.9 | 0.276 |
| 921.95 | 0.274 |
| 922.0 | 0.272 |
| 922.05 | 0.271 |
| 922.1 | 0.271 |
| 922.15 | 0.27 |
| 922.2 | 0.271 |
| 922.25 | 0.27 |
| 922.3 | 0.27 |
| 922.35 | 0.27 |
| 922.4 | 0.269 |
| 922.45 | 0.268 |
| 922.5 | 0.267 |
| 922.55 | 0.268 |
| 922.6 | 0.267 |
| 922.65 | 0.267 |
| 922.7 | 0.267 |
| 922.75 | 0.266 |
| 922.8 | 0.266 |
| 922.85 | 0.267 |
| 922.9 | 0.266 |
| 922.95 | 0.266 |
| 923.0 | 0.266 |
| 923.05 | 0.266 |
| 923.1 | 0.266 |
| 923.15 | 0.265 |
| 923.2 | 0.266 |
| 923.25 | 0.266 |
| 923.3 | 0.265 |
| 923.35 | 0.264 |
| 923.4 | 0.263 |
| 923.45 | 0.263 |
| 923.5 | 0.262 |
| 923.55 | 0.261 |
| 923.6 | 0.262 |
| 923.65 | 0.262 |
| 923.7 | 0.262 |
| 923.75 | 0.26 |
| 923.8 | 0.26 |
| 923.85 | 0.261 |
| 923.9 | 0.262 |
| 923.95 | 0.263 |
| 924.0 | 0.263 |
| 924.05 | 0.263 |
| 924.1 | 0.262 |
| 924.15 | 0.262 |
| 924.2 | 0.262 |
| 924.25 | 0.261 |
| 924.3 | 0.262 |
| 924.35 | 0.262 |
| 924.4 | 0.262 |
| 924.45 | 0.261 |
| 924.5 | 0.261 |
| 924.55 | 0.26 |
| 924.6 | 0.261 |
| 924.65 | 0.262 |
| 924.7 | 0.262 |
| 924.75 | 0.262 |
| 924.8 | 0.263 |
| 924.85 | 0.263 |
| 924.9 | 0.264 |
| 924.95 | 0.264 |
| 925.0 | 0.265 |
| 925.05 | 0.264 |
| 925.1 | 0.267 |
| 925.15 | 0.267 |
| 925.2 | 0.267 |
| 925.25 | 0.268 |
| 925.3 | 0.269 |
| 925.35 | 0.269 |
| 925.4 | 0.271 |
| 925.45 | 0.27 |
| 925.5 | 0.271 |
| 925.55 | 0.273 |
| 925.6 | 0.274 |
| 925.65 | 0.275 |
| 925.7 | 0.277 |
| 925.75 | 0.277 |
| 925.8 | 0.277 |
| 925.85 | 0.279 |
| 925.9 | 0.281 |
| 925.95 | 0.281 |
| 926.0 | 0.281 |
| 926.05 | 0.284 |
| 926.1 | 0.284 |
| 926.15 | 0.286 |
| 926.2 | 0.287 |
| 926.25 | 0.289 |
| 926.3 | 0.292 |
| 926.35 | 0.294 |
| 926.4 | 0.294 |
| 926.45 | 0.296 |
| 926.5 | 0.299 |
| 926.55 | 0.304 |
| 926.6 | 0.307 |
| 926.65 | 0.31 |
| 926.7 | 0.313 |
| 926.75 | 0.315 |
| 926.8 | 0.318 |
| 926.85 | 0.32 |
| 926.9 | 0.323 |
| 926.95 | 0.326 |
| 927.0 | 0.33 |
| 927.05 | 0.332 |
| 927.1 | 0.333 |
| 927.15 | 0.335 |
| 927.2 | 0.338 |
| 927.25 | 0.341 |
| 927.3 | 0.344 |
| 927.35 | 0.347 |
| 927.4 | 0.35 |
| 927.45 | 0.354 |
| 927.5 | 0.358 |
| 927.55 | 0.362 |
| 927.6 | 0.365 |
| 927.65 | 0.37 |
| 927.7 | 0.374 |
| 927.75 | 0.378 |
| 927.8 | 0.381 |
| 927.85 | 0.385 |
| 927.9 | 0.388 |
| 927.95 | 0.392 |
| 928.0 | 0.395 |
| 928.05 | 0.399 |
| 928.1 | 0.402 |
| 928.15 | 0.406 |
| 928.2 | 0.41 |
| 928.25 | 0.415 |
| 928.3 | 0.419 |
| 928.35 | 0.425 |
| 928.4 | 0.43 |
| 928.45 | 0.436 |
| 928.5 | 0.441 |
| 928.55 | 0.447 |
| 928.6 | 0.451 |
| 928.65 | 0.457 |
| 928.7 | 0.463 |
| 928.75 | 0.468 |
| 928.8 | 0.473 |
| 928.85 | 0.477 |
| 928.9 | 0.481 |
| 928.95 | 0.488 |
| 929.0 | 0.493 |
| 929.05 | 0.498 |
| 929.1 | 0.505 |
| 929.15 | 0.511 |
| 929.2 | 0.517 |
| 929.25 | 0.522 |
| 929.3 | 0.528 |
| 929.35 | 0.533 |
| 929.4 | 0.539 |
| 929.45 | 0.544 |
| 929.5 | 0.548 |
| 929.55 | 0.552 |
| 929.6 | 0.557 |
| 929.65 | 0.559 |
| 929.7 | 0.564 |
| 929.75 | 0.567 |
| 929.8 | 0.571 |
| 929.85 | 0.574 |
| 929.9 | 0.577 |
| 929.95 | 0.581 |
| 930.0 | 0.582 |
| 930.05 | 0.585 |
| 930.1 | 0.587 |
| 930.15 | 0.588 |
| 930.2 | 0.589 |
| 930.25 | 0.589 |
| 930.3 | 0.59 |
| 930.35 | 0.588 |
| 930.4 | 0.589 |
| 930.45 | 0.587 |
| 930.5 | 0.586 |
| 930.55 | 0.586 |
| 930.6 | 0.585 |
| 930.65 | 0.585 |
| 930.7 | 0.585 |
| 930.75 | 0.585 |
| 930.8 | 0.585 |
| 930.85 | 0.585 |
| 930.9 | 0.585 |
| 930.95 | 0.584 |
| 931.0 | 0.584 |
| 931.05 | 0.584 |
| 931.1 | 0.584 |
| 931.15 | 0.584 |
| 931.2 | 0.582 |
| 931.25 | 0.581 |
| 931.3 | 0.58 |
| 931.35 | 0.579 |
| 931.4 | 0.579 |
| 931.45 | 0.579 |
| 931.5 | 0.578 |
| 931.55 | 0.578 |
| 931.6 | 0.576 |
| 931.65 | 0.575 |
| 931.7 | 0.575 |
| 931.75 | 0.575 |
| 931.8 | 0.575 |
| 931.85 | 0.576 |
| 931.9 | 0.576 |
| 931.95 | 0.576 |
| 932.0 | 0.575 |
| 932.05 | 0.575 |
| 932.1 | 0.575 |
| 932.15 | 0.575 |
| 932.2 | 0.574 |
| 932.25 | 0.573 |
| 932.3 | 0.572 |
| 932.35 | 0.571 |
| 932.4 | 0.571 |
| 932.45 | 0.571 |
| 932.5 | 0.571 |
| 932.55 | 0.572 |
| 932.6 | 0.572 |
| 932.65 | 0.573 |
| 932.7 | 0.573 |
| 932.75 | 0.575 |
| 932.8 | 0.575 |
| 932.85 | 0.575 |
| 932.9 | 0.577 |
| 932.95 | 0.577 |
| 933.0 | 0.577 |
| 933.05 | 0.577 |
| 933.1 | 0.579 |
| 933.15 | 0.58 |
| 933.2 | 0.581 |
| 933.25 | 0.582 |
| 933.3 | 0.584 |
| 933.35 | 0.585 |
| 933.4 | 0.587 |
| 933.45 | 0.588 |
| 933.5 | 0.59 |
| 933.55 | 0.593 |
| 933.6 | 0.595 |
| 933.65 | 0.598 |
| 933.7 | 0.601 |
| 933.75 | 0.604 |
| 933.8 | 0.607 |
| 933.85 | 0.61 |
| 933.9 | 0.614 |
| 933.95 | 0.618 |
| 934.0 | 0.622 |
| 934.05 | 0.626 |
| 934.1 | 0.631 |
| 934.15 | 0.636 |
| 934.2 | 0.64 |
| 934.25 | 0.645 |
| 934.3 | 0.651 |
| 934.35 | 0.656 |
| 934.4 | 0.661 |
| 934.45 | 0.666 |
| 934.5 | 0.671 |
| 934.55 | 0.677 |
| 934.6 | 0.683 |
| 934.65 | 0.687 |
| 934.7 | 0.692 |
| 934.75 | 0.697 |
| 934.8 | 0.702 |
| 934.85 | 0.707 |
| 934.9 | 0.711 |
| 934.95 | 0.717 |
| 935.0 | 0.723 |
| 935.05 | 0.729 |
| 935.1 | 0.734 |
| 935.15 | 0.739 |
| 935.2 | 0.745 |
| 935.25 | 0.747 |
| 935.3 | 0.751 |
| 935.35 | 0.755 |
| 935.4 | 0.759 |
| 935.45 | 0.764 |
| 935.5 | 0.768 |
| 935.55 | 0.772 |
| 935.6 | 0.775 |
| 935.65 | 0.778 |
| 935.7 | 0.779 |
| 935.75 | 0.782 |
| 935.8 | 0.786 |
| 935.85 | 0.789 |
| 935.9 | 0.792 |
| 935.95 | 0.794 |
| 936.0 | 0.794 |
| 936.05 | 0.794 |
| 936.1 | 0.794 |
| 936.15 | 0.793 |
| 936.2 | 0.792 |
| 936.25 | 0.793 |
| 936.3 | 0.79 |
| 936.35 | 0.788 |
| 936.4 | 0.787 |
| 936.45 | 0.784 |
| 936.5 | 0.782 |
| 936.55 | 0.781 |
| 936.6 | 0.777 |
| 936.65 | 0.773 |
| 936.7 | 0.768 |
| 936.75 | 0.765 |
| 936.8 | 0.76 |
| 936.85 | 0.756 |
| 936.9 | 0.752 |
| 936.95 | 0.746 |
| 937.0 | 0.741 |
| 937.05 | 0.735 |
| 937.1 | 0.729 |
| 937.15 | 0.724 |
| 937.2 | 0.719 |
| 937.25 | 0.716 |
| 937.3 | 0.711 |
| 937.35 | 0.706 |
| 937.4 | 0.701 |
| 937.45 | 0.697 |
| 937.5 | 0.693 |
| 937.55 | 0.689 |
| 937.6 | 0.686 |
| 937.65 | 0.681 |
| 937.7 | 0.677 |
| 937.75 | 0.672 |
| 937.8 | 0.667 |
| 937.85 | 0.663 |
| 937.9 | 0.658 |
| 937.95 | 0.655 |
| 938.0 | 0.65 |
| 938.05 | 0.646 |
| 938.1 | 0.643 |
| 938.15 | 0.639 |
| 938.2 | 0.636 |
| 938.25 | 0.632 |
| 938.3 | 0.63 |
| 938.35 | 0.627 |
| 938.4 | 0.624 |
| 938.45 | 0.623 |
| 938.5 | 0.621 |
| 938.55 | 0.622 |
| 938.6 | 0.621 |
| 938.65 | 0.619 |
| 938.7 | 0.619 |
| 938.75 | 0.619 |
| 938.8 | 0.619 |
| 938.85 | 0.619 |
| 938.9 | 0.62 |
| 938.95 | 0.622 |
| 939.0 | 0.622 |
| 939.05 | 0.622 |
| 939.1 | 0.621 |
| 939.15 | 0.623 |
| 939.2 | 0.623 |
| 939.25 | 0.624 |
| 939.3 | 0.624 |
| 939.35 | 0.625 |
| 939.4 | 0.626 |
| 939.45 | 0.627 |
| 939.5 | 0.627 |
| 939.55 | 0.63 |
| 939.6 | 0.63 |
| 939.65 | 0.631 |
| 939.7 | 0.632 |
| 939.75 | 0.633 |
| 939.8 | 0.635 |
| 939.85 | 0.638 |
| 939.9 | 0.639 |
| 939.95 | 0.641 |
| 940.0 | 0.643 |
| 940.05 | 0.644 |
| 940.1 | 0.645 |
| 940.15 | 0.648 |
| 940.2 | 0.65 |
| 940.25 | 0.652 |
| 940.3 | 0.654 |
| 940.35 | 0.655 |
| 940.4 | 0.655 |
| 940.45 | 0.656 |
| 940.5 | 0.658 |
| 940.55 | 0.658 |
| 940.6 | 0.659 |
| 940.65 | 0.659 |
| 940.7 | 0.659 |
| 940.75 | 0.659 |
| 940.8 | 0.66 |
| 940.85 | 0.66 |
| 940.9 | 0.661 |
| 940.95 | 0.662 |
| 941.0 | 0.662 |
| 941.05 | 0.662 |
| 941.1 | 0.663 |
| 941.15 | 0.664 |
| 941.2 | 0.666 |
| 941.25 | 0.667 |
| 941.3 | 0.668 |
| 941.35 | 0.669 |
| 941.4 | 0.669 |
| 941.45 | 0.669 |
| 941.5 | 0.669 |
| 941.55 | 0.67 |
| 941.6 | 0.671 |
| 941.65 | 0.672 |
| 941.7 | 0.671 |
| 941.75 | 0.671 |
| 941.8 | 0.672 |
| 941.85 | 0.672 |
| 941.9 | 0.672 |
| 941.95 | 0.672 |
| 942.0 | 0.672 |
| 942.05 | 0.672 |
| 942.1 | 0.672 |
| 942.15 | 0.672 |
| 942.2 | 0.672 |
| 942.25 | 0.672 |
| 942.3 | 0.672 |
| 942.35 | 0.673 |
| 942.4 | 0.674 |
| 942.45 | 0.675 |
| 942.5 | 0.675 |
| 942.55 | 0.676 |
| 942.6 | 0.677 |
| 942.65 | 0.678 |
| 942.7 | 0.679 |
| 942.75 | 0.68 |
| 942.8 | 0.681 |
| 942.85 | 0.683 |
| 942.9 | 0.682 |
| 942.95 | 0.682 |
| 943.0 | 0.683 |
| 943.05 | 0.685 |
| 943.1 | 0.686 |
| 943.15 | 0.688 |
| 943.2 | 0.689 |
| 943.25 | 0.691 |
| 943.3 | 0.693 |
| 943.35 | 0.694 |
| 943.4 | 0.696 |
| 943.45 | 0.7 |
| 943.5 | 0.702 |
| 943.55 | 0.705 |
| 943.6 | 0.706 |
| 943.65 | 0.709 |
| 943.7 | 0.711 |
| 943.75 | 0.714 |
| 943.8 | 0.715 |
| 943.85 | 0.717 |
| 943.9 | 0.72 |
| 943.95 | 0.724 |
| 944.0 | 0.727 |
| 944.05 | 0.731 |
| 944.1 | 0.735 |
| 944.15 | 0.741 |
| 944.2 | 0.745 |
| 944.25 | 0.751 |
| 944.3 | 0.756 |
| 944.35 | 0.763 |
| 944.4 | 0.771 |
| 944.45 | 0.778 |
| 944.5 | 0.786 |
| 944.55 | 0.794 |
| 944.6 | 0.801 |
| 944.65 | 0.807 |
| 944.7 | 0.814 |
| 944.75 | 0.822 |
| 944.8 | 0.828 |
| 944.85 | 0.838 |
| 944.9 | 0.845 |
| 944.95 | 0.852 |
| 945.0 | 0.858 |
| 945.05 | 0.864 |
| 945.1 | 0.87 |
| 945.15 | 0.877 |
| 945.2 | 0.885 |
| 945.25 | 0.892 |
| 945.3 | 0.899 |
| 945.35 | 0.906 |
| 945.4 | 0.913 |
| 945.45 | 0.92 |
| 945.5 | 0.927 |
| 945.55 | 0.934 |
| 945.6 | 0.941 |
| 945.65 | 0.947 |
| 945.7 | 0.955 |
| 945.75 | 0.96 |
| 945.8 | 0.967 |
| 945.85 | 0.972 |
| 945.9 | 0.976 |
| 945.95 | 0.98 |
| 946.0 | 0.983 |
| 946.05 | 0.988 |
| 946.1 | 0.992 |
| 946.15 | 0.996 |
| 946.2 | 1.001 |
| 946.25 | 1.004 |
| 946.3 | 1.008 |
| 946.35 | 1.012 |
| 946.4 | 1.016 |
| 946.45 | 1.02 |
| 946.5 | 1.025 |
| 946.55 | 1.029 |
| 946.6 | 1.034 |
| 946.65 | 1.04 |
| 946.7 | 1.044 |
| 946.75 | 1.048 |
| 946.8 | 1.053 |
| 946.85 | 1.058 |
| 946.9 | 1.063 |
| 946.95 | 1.069 |
| 947.0 | 1.074 |
| 947.05 | 1.079 |
| 947.1 | 1.084 |
| 947.15 | 1.089 |
| 947.2 | 1.094 |
| 947.25 | 1.097 |
| 947.3 | 1.102 |
| 947.35 | 1.107 |
| 947.4 | 1.112 |
| 947.45 | 1.116 |
| 947.5 | 1.122 |
| 947.55 | 1.126 |
| 947.6 | 1.132 |
| 947.65 | 1.137 |
| 947.7 | 1.141 |
| 947.75 | 1.147 |
| 947.8 | 1.152 |
| 947.85 | 1.157 |
| 947.9 | 1.161 |
| 947.95 | 1.164 |
| 948.0 | 1.17 |
| 948.05 | 1.173 |
| 948.1 | 1.177 |
| 948.15 | 1.181 |
| 948.2 | 1.185 |
| 948.25 | 1.189 |
| 948.3 | 1.191 |
| 948.35 | 1.196 |
| 948.4 | 1.2 |
| 948.45 | 1.207 |
| 948.5 | 1.213 |
| 948.55 | 1.217 |
| 948.6 | 1.223 |
| 948.65 | 1.227 |
| 948.7 | 1.233 |
| 948.75 | 1.239 |
| 948.8 | 1.244 |
| 948.85 | 1.252 |
| 948.9 | 1.258 |
| 948.95 | 1.265 |
| 949.0 | 1.271 |
| 949.05 | 1.277 |
| 949.1 | 1.283 |
| 949.15 | 1.289 |
| 949.2 | 1.299 |
| 949.25 | 1.307 |
| 949.3 | 1.315 |
| 949.35 | 1.323 |
| 949.4 | 1.33 |
| 949.45 | 1.339 |
| 949.5 | 1.347 |
| 949.55 | 1.355 |
| 949.6 | 1.365 |
| 949.65 | 1.375 |
| 949.7 | 1.386 |
| 949.75 | 1.398 |
| 949.8 | 1.408 |
| 949.85 | 1.418 |
| 949.9 | 1.429 |
| 949.95 | 1.441 |
| 950.0 | 1.452 |
| 950.05 | 1.466 |
| 950.1 | 1.48 |
| 950.15 | 1.492 |
| 950.2 | 1.505 |
| 950.25 | 1.518 |
| 950.3 | 1.529 |
| 950.35 | 1.543 |
| 950.4 | 1.556 |
| 950.45 | 1.571 |
| 950.5 | 1.586 |
| 950.55 | 1.603 |
| 950.6 | 1.619 |
| 950.65 | 1.634 |
| 950.7 | 1.65 |
| 950.75 | 1.666 |
| 950.8 | 1.682 |
| 950.85 | 1.698 |
| 950.9 | 1.714 |
| 950.95 | 1.73 |
| 951.0 | 1.746 |
| 951.05 | 1.759 |
| 951.1 | 1.769 |
| 951.15 | 1.777 |
| 951.2 | 1.785 |
| 951.25 | 1.792 |
| 951.3 | 1.795 |
| 951.35 | 1.794 |
| 951.4 | 1.79 |
| 951.45 | 1.786 |
| 951.5 | 1.779 |
| 951.55 | 1.768 |
| 951.6 | 1.755 |
| 951.65 | 1.742 |
| 951.7 | 1.726 |
| 951.75 | 1.709 |
| 951.8 | 1.683 |
| 951.85 | 1.658 |
| 951.9 | 1.63 |
| 951.95 | 1.601 |
| 952.0 | 1.571 |
| 952.05 | 1.539 |
| 952.1 | 1.509 |
| 952.15 | 1.478 |
| 952.2 | 1.447 |
| 952.25 | 1.412 |
| 952.3 | 1.376 |
| 952.35 | 1.346 |
| 952.4 | 1.314 |
| 952.45 | 1.285 |
| 952.5 | 1.257 |
| 952.55 | 1.229 |
| 952.6 | 1.201 |
| 952.65 | 1.17 |
| 952.7 | 1.138 |
| 952.75 | 1.105 |
| 952.8 | 1.077 |
| 952.85 | 1.051 |
| 952.9 | 1.023 |
| 952.95 | 0.997 |
| 953.0 | 0.969 |
| 953.05 | 0.945 |
| 953.1 | 0.918 |
| 953.15 | 0.891 |
| 953.2 | 0.867 |
| 953.25 | 0.845 |
| 953.3 | 0.823 |
| 953.35 | 0.803 |
| 953.4 | 0.782 |
| 953.45 | 0.764 |
| 953.5 | 0.746 |
| 953.55 | 0.728 |
| 953.6 | 0.708 |
| 953.65 | 0.692 |
| 953.7 | 0.678 |
| 953.75 | 0.665 |
| 953.8 | 0.652 |
| 953.85 | 0.641 |
| 953.9 | 0.628 |
| 953.95 | 0.616 |
| 954.0 | 0.604 |
| 954.05 | 0.592 |
| 954.1 | 0.582 |
| 954.15 | 0.573 |
| 954.2 | 0.565 |
| 954.25 | 0.555 |
| 954.3 | 0.547 |
| 954.35 | 0.537 |
| 954.4 | 0.529 |
| 954.45 | 0.52 |
| 954.5 | 0.511 |
| 954.55 | 0.505 |
| 954.6 | 0.498 |
| 954.65 | 0.493 |
| 954.7 | 0.487 |
| 954.75 | 0.482 |
| 954.8 | 0.477 |
| 954.85 | 0.472 |
| 954.9 | 0.467 |
| 954.95 | 0.461 |
| 955.0 | 0.456 |
| 955.05 | 0.451 |
| 955.1 | 0.446 |
| 955.15 | 0.44 |
| 955.2 | 0.434 |
| 955.25 | 0.428 |
| 955.3 | 0.42 |
| 955.35 | 0.414 |
| 955.4 | 0.409 |
| 955.45 | 0.405 |
| 955.5 | 0.399 |
| 955.55 | 0.395 |
| 955.6 | 0.391 |
| 955.65 | 0.387 |
| 955.7 | 0.384 |
| 955.75 | 0.381 |
| 955.8 | 0.378 |
| 955.85 | 0.377 |
| 955.9 | 0.374 |
| 955.95 | 0.371 |
| 956.0 | 0.37 |
| 956.05 | 0.369 |
| 956.1 | 0.366 |
| 956.15 | 0.363 |
| 956.2 | 0.36 |
| 956.25 | 0.359 |
| 956.3 | 0.356 |
| 956.35 | 0.355 |
| 956.4 | 0.352 |
| 956.45 | 0.35 |
| 956.5 | 0.347 |
| 956.55 | 0.346 |
| 956.6 | 0.344 |
| 956.65 | 0.342 |
| 956.7 | 0.341 |
| 956.75 | 0.34 |
| 956.8 | 0.339 |
| 956.85 | 0.338 |
| 956.9 | 0.337 |
| 956.95 | 0.336 |
| 957.0 | 0.336 |
| 957.05 | 0.335 |
| 957.1 | 0.334 |
| 957.15 | 0.333 |
| 957.2 | 0.333 |
| 957.25 | 0.332 |
| 957.3 | 0.332 |
| 957.35 | 0.331 |
| 957.4 | 0.331 |
| 957.45 | 0.33 |
| 957.5 | 0.33 |
| 957.55 | 0.328 |
| 957.6 | 0.329 |
| 957.65 | 0.33 |
| 957.7 | 0.329 |
| 957.75 | 0.328 |
| 957.8 | 0.328 |
| 957.85 | 0.327 |
| 957.9 | 0.328 |
| 957.95 | 0.328 |
| 958.0 | 0.328 |
| 958.05 | 0.329 |
| 958.1 | 0.33 |
| 958.15 | 0.33 |
| 958.2 | 0.33 |
| 958.25 | 0.33 |
| 958.3 | 0.331 |
| 958.35 | 0.331 |
| 958.4 | 0.332 |
| 958.45 | 0.332 |
| 958.5 | 0.333 |
| 958.55 | 0.334 |
| 958.6 | 0.335 |
| 958.65 | 0.336 |
| 958.7 | 0.336 |
| 958.75 | 0.337 |
| 958.8 | 0.339 |
| 958.85 | 0.341 |
| 958.9 | 0.342 |
| 958.95 | 0.344 |
| 959.0 | 0.344 |
| 959.05 | 0.346 |
| 959.1 | 0.346 |
| 959.15 | 0.346 |
| 959.2 | 0.346 |
| 959.25 | 0.347 |
| 959.3 | 0.349 |
| 959.35 | 0.35 |
| 959.4 | 0.349 |
| 959.45 | 0.35 |
| 959.5 | 0.35 |
| 959.55 | 0.351 |
| 959.6 | 0.351 |
| 959.65 | 0.352 |
| 959.7 | 0.352 |
| 959.75 | 0.354 |
| 959.8 | 0.355 |
| 959.85 | 0.354 |
| 959.9 | 0.354 |
| 959.95 | 0.355 |
| 960.0 | 0.355 |
| 960.05 | 0.356 |
| 960.1 | 0.357 |
| 960.15 | 0.357 |
| 960.2 | 0.357 |
| 960.25 | 0.357 |
| 960.3 | 0.358 |
| 960.35 | 0.358 |
| 960.4 | 0.358 |
| 960.45 | 0.359 |
| 960.5 | 0.36 |
| 960.55 | 0.36 |
| 960.6 | 0.36 |
| 960.65 | 0.359 |
| 960.7 | 0.358 |
| 960.75 | 0.358 |
| 960.8 | 0.357 |
| 960.85 | 0.357 |
| 960.9 | 0.356 |
| 960.95 | 0.355 |
| 961.0 | 0.354 |
| 961.05 | 0.353 |
| 961.1 | 0.353 |
| 961.15 | 0.353 |
| 961.2 | 0.354 |
| 961.25 | 0.354 |
| 961.3 | 0.353 |
| 961.35 | 0.353 |
| 961.4 | 0.352 |
| 961.45 | 0.352 |
| 961.5 | 0.352 |
| 961.55 | 0.352 |
| 961.6 | 0.352 |
| 961.65 | 0.352 |
| 961.7 | 0.351 |
| 961.75 | 0.351 |
| 961.8 | 0.35 |
| 961.85 | 0.35 |
| 961.9 | 0.351 |
| 961.95 | 0.351 |
| 962.0 | 0.351 |
| 962.05 | 0.352 |
| 962.1 | 0.351 |
| 962.15 | 0.351 |
| 962.2 | 0.351 |
| 962.25 | 0.351 |
| 962.3 | 0.351 |
| 962.35 | 0.35 |
| 962.4 | 0.35 |
| 962.45 | 0.35 |
| 962.5 | 0.35 |
| 962.55 | 0.351 |
| 962.6 | 0.35 |
| 962.65 | 0.351 |
| 962.7 | 0.351 |
| 962.75 | 0.352 |
| 962.8 | 0.351 |
| 962.85 | 0.351 |
| 962.9 | 0.352 |
| 962.95 | 0.352 |
| 963.0 | 0.353 |
| 963.05 | 0.353 |
| 963.1 | 0.353 |
| 963.15 | 0.353 |
| 963.2 | 0.354 |
| 963.25 | 0.354 |
| 963.3 | 0.353 |
| 963.35 | 0.354 |
| 963.4 | 0.356 |
| 963.45 | 0.355 |
| 963.5 | 0.355 |
| 963.55 | 0.355 |
| 963.6 | 0.356 |
| 963.65 | 0.356 |
| 963.7 | 0.356 |
| 963.75 | 0.358 |
| 963.8 | 0.358 |
| 963.85 | 0.359 |
| 963.9 | 0.36 |
| 963.95 | 0.359 |
| 964.0 | 0.36 |
| 964.05 | 0.362 |
| 964.1 | 0.364 |
| 964.15 | 0.364 |
| 964.2 | 0.365 |
| 964.25 | 0.366 |
| 964.3 | 0.366 |
| 964.35 | 0.368 |
| 964.4 | 0.369 |
| 964.45 | 0.37 |
| 964.5 | 0.371 |
| 964.55 | 0.374 |
| 964.6 | 0.374 |
| 964.65 | 0.376 |
| 964.7 | 0.378 |
| 964.75 | 0.379 |
| 964.8 | 0.38 |
| 964.85 | 0.381 |
| 964.9 | 0.382 |
| 964.95 | 0.382 |
| 965.0 | 0.383 |
| 965.05 | 0.384 |
| 965.1 | 0.385 |
| 965.15 | 0.386 |
| 965.2 | 0.387 |
| 965.25 | 0.388 |
| 965.3 | 0.389 |
| 965.35 | 0.391 |
| 965.4 | 0.392 |
| 965.45 | 0.392 |
| 965.5 | 0.394 |
| 965.55 | 0.396 |
| 965.6 | 0.396 |
| 965.65 | 0.397 |
| 965.7 | 0.398 |
| 965.75 | 0.399 |
| 965.8 | 0.399 |
| 965.85 | 0.401 |
| 965.9 | 0.402 |
| 965.95 | 0.403 |
| 966.0 | 0.405 |
| 966.05 | 0.407 |
| 966.1 | 0.408 |
| 966.15 | 0.41 |
| 966.2 | 0.412 |
| 966.25 | 0.414 |
| 966.3 | 0.414 |
| 966.35 | 0.417 |
| 966.4 | 0.418 |
| 966.45 | 0.419 |
| 966.5 | 0.419 |
| 966.55 | 0.419 |
| 966.6 | 0.42 |
| 966.65 | 0.42 |
| 966.7 | 0.421 |
| 966.75 | 0.421 |
| 966.8 | 0.421 |
| 966.85 | 0.422 |
| 966.9 | 0.422 |
| 966.95 | 0.423 |
| 967.0 | 0.423 |
| 967.05 | 0.424 |
| 967.1 | 0.423 |
| 967.15 | 0.423 |
| 967.2 | 0.422 |
| 967.25 | 0.422 |
| 967.3 | 0.423 |
| 967.35 | 0.423 |
| 967.4 | 0.422 |
| 967.45 | 0.422 |
| 967.5 | 0.422 |
| 967.55 | 0.422 |
| 967.6 | 0.421 |
| 967.65 | 0.422 |
| 967.7 | 0.423 |
| 967.75 | 0.425 |
| 967.8 | 0.423 |
| 967.85 | 0.422 |
| 967.9 | 0.422 |
| 967.95 | 0.423 |
| 968.0 | 0.423 |
| 968.05 | 0.422 |
| 968.1 | 0.421 |
| 968.15 | 0.421 |
| 968.2 | 0.42 |
| 968.25 | 0.419 |
| 968.3 | 0.418 |
| 968.35 | 0.417 |
| 968.4 | 0.417 |
| 968.45 | 0.415 |
| 968.5 | 0.415 |
| 968.55 | 0.414 |
| 968.6 | 0.413 |
| 968.65 | 0.411 |
| 968.7 | 0.411 |
| 968.75 | 0.409 |
| 968.8 | 0.408 |
| 968.85 | 0.408 |
| 968.9 | 0.407 |
| 968.95 | 0.406 |
| 969.0 | 0.405 |
| 969.05 | 0.403 |
| 969.1 | 0.402 |
| 969.15 | 0.401 |
| 969.2 | 0.4 |
| 969.25 | 0.397 |
| 969.3 | 0.396 |
| 969.35 | 0.394 |
| 969.4 | 0.393 |
| 969.45 | 0.392 |
| 969.5 | 0.391 |
| 969.55 | 0.39 |
| 969.6 | 0.389 |
| 969.65 | 0.388 |
| 969.7 | 0.387 |
| 969.75 | 0.385 |
| 969.8 | 0.386 |
| 969.85 | 0.385 |
| 969.9 | 0.385 |
| 969.95 | 0.384 |
| 970.0 | 0.383 |
| 970.05 | 0.383 |
| 970.1 | 0.383 |
| 970.15 | 0.382 |
| 970.2 | 0.381 |
| 970.25 | 0.38 |
| 970.3 | 0.381 |
| 970.35 | 0.38 |
| 970.4 | 0.379 |
| 970.45 | 0.378 |
| 970.5 | 0.378 |
| 970.55 | 0.377 |
| 970.6 | 0.377 |
| 970.65 | 0.376 |
| 970.7 | 0.376 |
| 970.75 | 0.376 |
| 970.8 | 0.376 |
| 970.85 | 0.376 |
| 970.9 | 0.375 |
| 970.95 | 0.377 |
| 971.0 | 0.377 |
| 971.05 | 0.376 |
| 971.1 | 0.377 |
| 971.15 | 0.376 |
| 971.2 | 0.376 |
| 971.25 | 0.376 |
| 971.3 | 0.378 |
| 971.35 | 0.38 |
| 971.4 | 0.38 |
| 971.45 | 0.381 |
| 971.5 | 0.381 |
| 971.55 | 0.382 |
| 971.6 | 0.383 |
| 971.65 | 0.383 |
| 971.7 | 0.384 |
| 971.75 | 0.384 |
| 971.8 | 0.386 |
| 971.85 | 0.386 |
| 971.9 | 0.386 |
| 971.95 | 0.387 |
| 972.0 | 0.389 |
| 972.05 | 0.39 |
| 972.1 | 0.391 |
| 972.15 | 0.393 |
| 972.2 | 0.396 |
| 972.25 | 0.399 |
| 972.3 | 0.401 |
| 972.35 | 0.404 |
| 972.4 | 0.408 |
| 972.45 | 0.412 |
| 972.5 | 0.415 |
| 972.55 | 0.419 |
| 972.6 | 0.422 |
| 972.65 | 0.426 |
| 972.7 | 0.429 |
| 972.75 | 0.432 |
| 972.8 | 0.436 |
| 972.85 | 0.441 |
| 972.9 | 0.446 |
| 972.95 | 0.452 |
| 973.0 | 0.456 |
| 973.05 | 0.462 |
| 973.1 | 0.467 |
| 973.15 | 0.471 |
| 973.2 | 0.478 |
| 973.25 | 0.486 |
| 973.3 | 0.493 |
| 973.35 | 0.5 |
| 973.4 | 0.507 |
| 973.45 | 0.513 |
| 973.5 | 0.52 |
| 973.55 | 0.527 |
| 973.6 | 0.534 |
| 973.65 | 0.542 |
| 973.7 | 0.551 |
| 973.75 | 0.56 |
| 973.8 | 0.568 |
| 973.85 | 0.576 |
| 973.9 | 0.585 |
| 973.95 | 0.594 |
| 974.0 | 0.604 |
| 974.05 | 0.612 |
| 974.1 | 0.623 |
| 974.15 | 0.635 |
| 974.2 | 0.647 |
| 974.25 | 0.659 |
| 974.3 | 0.67 |
| 974.35 | 0.682 |
| 974.4 | 0.695 |
| 974.45 | 0.709 |
| 974.5 | 0.721 |
| 974.55 | 0.735 |
| 974.6 | 0.753 |
| 974.65 | 0.771 |
| 974.7 | 0.788 |
| 974.75 | 0.807 |
| 974.8 | 0.826 |
| 974.85 | 0.846 |
| 974.9 | 0.867 |
| 974.95 | 0.891 |
| 975.0 | 0.916 |
| 975.05 | 0.948 |
| 975.1 | 0.981 |
| 975.15 | 1.012 |
| 975.2 | 1.046 |
| 975.25 | 1.081 |
| 975.3 | 1.119 |
| 975.35 | 1.16 |
| 975.4 | 1.201 |
| 975.45 | 1.247 |
| 975.5 | 1.3 |
| 975.55 | 1.353 |
| 975.6 | 1.407 |
| 975.65 | 1.465 |
| 975.7 | 1.525 |
| 975.75 | 1.585 |
| 975.8 | 1.648 |
| 975.85 | 1.712 |
| 975.9 | 1.789 |
| 975.95 | 1.872 |
| 976.0 | 1.954 |
| 976.05 | 2.032 |
| 976.1 | 2.111 |
| 976.15 | 2.19 |
| 976.2 | 2.269 |
| 976.25 | 2.349 |
| 976.3 | 2.439 |
| 976.35 | 2.529 |
| 976.4 | 2.621 |
| 976.45 | 2.701 |
| 976.5 | 2.78 |
| 976.55 | 2.858 |
| 976.6 | 2.941 |
| 976.65 | 3.021 |
| 976.7 | 3.104 |
| 976.75 | 3.195 |
| 976.8 | 3.293 |
| 976.85 | 3.388 |
| 976.9 | 3.482 |
| 976.95 | 3.574 |
| 977.0 | 3.665 |
| 977.05 | 3.758 |
| 977.1 | 3.846 |
| 977.15 | 3.933 |
| 977.2 | 4.022 |
| 977.25 | 4.105 |
| 977.3 | 4.171 |
| 977.35 | 4.222 |
| 977.4 | 4.261 |
| 977.45 | 4.29 |
| 977.5 | 4.31 |
| 977.55 | 4.318 |
| 977.6 | 4.313 |
| 977.65 | 4.295 |
| 977.7 | 4.255 |
| 977.75 | 4.194 |
| 977.8 | 4.129 |
| 977.85 | 4.049 |
| 977.9 | 3.958 |
| 977.95 | 3.868 |
| 978.0 | 3.77 |
| 978.05 | 3.668 |
| 978.1 | 3.542 |
| 978.15 | 3.408 |
| 978.2 | 3.274 |
| 978.25 | 3.154 |
| 978.3 | 3.034 |
| 978.35 | 2.915 |
| 978.4 | 2.8 |
| 978.45 | 2.688 |
| 978.5 | 2.569 |
| 978.55 | 2.456 |
| 978.6 | 2.347 |
| 978.65 | 2.255 |
| 978.7 | 2.169 |
| 978.75 | 2.09 |
| 978.8 | 2.009 |
| 978.85 | 1.931 |
| 978.9 | 1.858 |
| 978.95 | 1.785 |
| 979.0 | 1.709 |
| 979.05 | 1.64 |
| 979.1 | 1.574 |
| 979.15 | 1.512 |
| 979.2 | 1.454 |
| 979.25 | 1.396 |
| 979.3 | 1.339 |
| 979.35 | 1.285 |
| 979.4 | 1.228 |
| 979.45 | 1.172 |
| 979.5 | 1.122 |
| 979.55 | 1.08 |
| 979.6 | 1.041 |
| 979.65 | 1.003 |
| 979.7 | 0.966 |
| 979.75 | 0.931 |
| 979.8 | 0.896 |
| 979.85 | 0.864 |
| 979.9 | 0.834 |
| 979.95 | 0.81 |
| 980.0 | 0.787 |
| 980.05 | 0.766 |
| 980.1 | 0.744 |
| 980.15 | 0.724 |
| 980.2 | 0.705 |
| 980.25 | 0.686 |
| 980.3 | 0.666 |
| 980.35 | 0.649 |
| 980.4 | 0.633 |
| 980.45 | 0.619 |
| 980.5 | 0.604 |
| 980.55 | 0.589 |
| 980.6 | 0.576 |
| 980.65 | 0.564 |
| 980.7 | 0.55 |
| 980.75 | 0.538 |
| 980.8 | 0.527 |
| 980.85 | 0.517 |
| 980.9 | 0.508 |
| 980.95 | 0.499 |
| 981.0 | 0.49 |
| 981.05 | 0.483 |
| 981.1 | 0.476 |
| 981.15 | 0.468 |
| 981.2 | 0.458 |
| 981.25 | 0.451 |
| 981.3 | 0.445 |
| 981.35 | 0.437 |
| 981.4 | 0.431 |
| 981.45 | 0.424 |
| 981.5 | 0.416 |
| 981.55 | 0.409 |
| 981.6 | 0.402 |
| 981.65 | 0.396 |
| 981.7 | 0.391 |
| 981.75 | 0.385 |
| 981.8 | 0.38 |
| 981.85 | 0.375 |
| 981.9 | 0.371 |
| 981.95 | 0.367 |
| 982.0 | 0.363 |
| 982.05 | 0.36 |
| 982.1 | 0.356 |
| 982.15 | 0.352 |
| 982.2 | 0.349 |
| 982.25 | 0.345 |
| 982.3 | 0.343 |
| 982.35 | 0.34 |
| 982.4 | 0.339 |
| 982.45 | 0.335 |
| 982.5 | 0.332 |
| 982.55 | 0.33 |
| 982.6 | 0.327 |
| 982.65 | 0.326 |
| 982.7 | 0.324 |
| 982.75 | 0.321 |
| 982.8 | 0.319 |
| 982.85 | 0.317 |
| 982.9 | 0.315 |
| 982.95 | 0.313 |
| 983.0 | 0.311 |
| 983.05 | 0.31 |
| 983.1 | 0.309 |
| 983.15 | 0.308 |
| 983.2 | 0.306 |
| 983.25 | 0.305 |
| 983.3 | 0.305 |
| 983.35 | 0.304 |
| 983.4 | 0.304 |
| 983.45 | 0.303 |
| 983.5 | 0.301 |
| 983.55 | 0.301 |
| 983.6 | 0.3 |
| 983.65 | 0.3 |
| 983.7 | 0.299 |
| 983.75 | 0.298 |
| 983.8 | 0.297 |
| 983.85 | 0.297 |
| 983.9 | 0.296 |
| 983.95 | 0.295 |
| 984.0 | 0.295 |
| 984.05 | 0.294 |
| 984.1 | 0.293 |
| 984.15 | 0.293 |
| 984.2 | 0.292 |
| 984.25 | 0.291 |
| 984.3 | 0.291 |
| 984.35 | 0.29 |
| 984.4 | 0.29 |
| 984.45 | 0.288 |
| 984.5 | 0.287 |
| 984.55 | 0.288 |
| 984.6 | 0.287 |
| 984.65 | 0.287 |
| 984.7 | 0.285 |
| 984.75 | 0.286 |
| 984.8 | 0.285 |
| 984.85 | 0.283 |
| 984.9 | 0.282 |
| 984.95 | 0.281 |
| 985.0 | 0.281 |
| 985.05 | 0.281 |
| 985.1 | 0.279 |
| 985.15 | 0.278 |
| 985.2 | 0.278 |
| 985.25 | 0.278 |
| 985.3 | 0.276 |
| 985.35 | 0.276 |
| 985.4 | 0.276 |
| 985.45 | 0.275 |
| 985.5 | 0.274 |
| 985.55 | 0.273 |
| 985.6 | 0.272 |
| 985.65 | 0.272 |
| 985.7 | 0.272 |
| 985.75 | 0.271 |
| 985.8 | 0.27 |
| 985.85 | 0.269 |
| 985.9 | 0.268 |
| 985.95 | 0.268 |
| 986.0 | 0.268 |
| 986.05 | 0.267 |
| 986.1 | 0.268 |
| 986.15 | 0.268 |
| 986.2 | 0.267 |
| 986.25 | 0.266 |
| 986.3 | 0.265 |
| 986.35 | 0.265 |
| 986.4 | 0.266 |
| 986.45 | 0.265 |
| 986.5 | 0.266 |
| 986.55 | 0.265 |
| 986.6 | 0.265 |
| 986.65 | 0.263 |
| 986.7 | 0.263 |
| 986.75 | 0.263 |
| 986.8 | 0.262 |
| 986.85 | 0.262 |
| 986.9 | 0.262 |
| 986.95 | 0.261 |
| 987.0 | 0.26 |
| 987.05 | 0.26 |
| 987.1 | 0.261 |
| 987.15 | 0.26 |
| 987.2 | 0.261 |
| 987.25 | 0.26 |
| 987.3 | 0.261 |
| 987.35 | 0.26 |
| 987.4 | 0.26 |
| 987.45 | 0.26 |
| 987.5 | 0.26 |
| 987.55 | 0.26 |
| 987.6 | 0.259 |
| 987.65 | 0.259 |
| 987.7 | 0.258 |
| 987.75 | 0.257 |
| 987.8 | 0.257 |
| 987.85 | 0.255 |
| 987.9 | 0.255 |
| 987.95 | 0.255 |
| 988.0 | 0.255 |
| 988.05 | 0.254 |
| 988.1 | 0.253 |
| 988.15 | 0.253 |
| 988.2 | 0.251 |
| 988.25 | 0.25 |
| 988.3 | 0.25 |
| 988.35 | 0.249 |
| 988.4 | 0.248 |
| 988.45 | 0.248 |
| 988.5 | 0.246 |
| 988.55 | 0.245 |
| 988.6 | 0.244 |
| 988.65 | 0.243 |
| 988.7 | 0.242 |
| 988.75 | 0.242 |
| 988.8 | 0.242 |
| 988.85 | 0.242 |
| 988.9 | 0.241 |
| 988.95 | 0.241 |
| 989.0 | 0.24 |
| 989.05 | 0.24 |
| 989.1 | 0.239 |
| 989.15 | 0.237 |
| 989.2 | 0.237 |
| 989.25 | 0.236 |
| 989.3 | 0.234 |
| 989.35 | 0.234 |
| 989.4 | 0.233 |
| 989.45 | 0.232 |
| 989.5 | 0.229 |
| 989.55 | 0.228 |
| 989.6 | 0.227 |
| 989.65 | 0.225 |
| 989.7 | 0.225 |
| 989.75 | 0.223 |
| 989.8 | 0.222 |
| 989.85 | 0.221 |
| 989.9 | 0.22 |
| 989.95 | 0.219 |
| 990.0 | 0.218 |
| 990.05 | 0.217 |
| 990.1 | 0.216 |
| 990.15 | 0.215 |
| 990.2 | 0.215 |
| 990.25 | 0.213 |
| 990.3 | 0.211 |
| 990.35 | 0.209 |
| 990.4 | 0.208 |
| 990.45 | 0.208 |
| 990.5 | 0.207 |
| 990.55 | 0.206 |
| 990.6 | 0.205 |
| 990.65 | 0.204 |
| 990.7 | 0.203 |
| 990.75 | 0.202 |
| 990.8 | 0.202 |
| 990.85 | 0.202 |
| 990.9 | 0.201 |
| 990.95 | 0.2 |
| 991.0 | 0.198 |
| 991.05 | 0.196 |
| 991.1 | 0.195 |
| 991.15 | 0.195 |
| 991.2 | 0.194 |
| 991.25 | 0.194 |
| 991.3 | 0.191 |
| 991.35 | 0.19 |
| 991.4 | 0.188 |
| 991.45 | 0.188 |
| 991.5 | 0.187 |
| 991.55 | 0.185 |
| 991.6 | 0.185 |
| 991.65 | 0.185 |
| 991.7 | 0.184 |
| 991.75 | 0.182 |
| 991.8 | 0.181 |
| 991.85 | 0.18 |
| 991.9 | 0.18 |
| 991.95 | 0.18 |
| 992.0 | 0.179 |
| 992.05 | 0.179 |
| 992.1 | 0.178 |
| 992.15 | 0.178 |
| 992.2 | 0.177 |
| 992.25 | 0.177 |
| 992.3 | 0.178 |
| 992.35 | 0.179 |
| 992.4 | 0.179 |
| 992.45 | 0.178 |
| 992.5 | 0.177 |
| 992.55 | 0.176 |
| 992.6 | 0.176 |
| 992.65 | 0.177 |
| 992.7 | 0.175 |
| 992.75 | 0.174 |
| 992.8 | 0.173 |
| 992.85 | 0.172 |
| 992.9 | 0.171 |
| 992.95 | 0.17 |
| 993.0 | 0.171 |
| 993.05 | 0.171 |
| 993.1 | 0.17 |
| 993.15 | 0.17 |
| 993.2 | 0.169 |
| 993.25 | 0.169 |
| 993.3 | 0.169 |
| 993.35 | 0.169 |
| 993.4 | 0.168 |
| 993.45 | 0.168 |
| 993.5 | 0.166 |
| 993.55 | 0.167 |
| 993.6 | 0.166 |
| 993.65 | 0.166 |
| 993.7 | 0.165 |
| 993.75 | 0.164 |
| 993.8 | 0.163 |
| 993.85 | 0.162 |
| 993.9 | 0.161 |
| 993.95 | 0.161 |
| 994.0 | 0.16 |
| 994.05 | 0.16 |
| 994.1 | 0.16 |
| 994.15 | 0.158 |
| 994.2 | 0.157 |
| 994.25 | 0.157 |
| 994.3 | 0.156 |
| 994.35 | 0.156 |
| 994.4 | 0.155 |
| 994.45 | 0.153 |
| 994.5 | 0.151 |
| 994.55 | 0.151 |
| 994.6 | 0.151 |
| 994.65 | 0.148 |
| 994.7 | 0.147 |
| 994.75 | 0.147 |
| 994.8 | 0.147 |
| 994.85 | 0.147 |
| 994.9 | 0.145 |
| 994.95 | 0.144 |
| 995.0 | 0.144 |
| 995.05 | 0.143 |
| 995.1 | 0.142 |
| 995.15 | 0.14 |
| 995.2 | 0.14 |
| 995.25 | 0.139 |
| 995.3 | 0.139 |
| 995.35 | 0.137 |
| 995.4 | 0.135 |
| 995.45 | 0.136 |
| 995.5 | 0.135 |
| 995.55 | 0.134 |
| 995.6 | 0.134 |
| 995.65 | 0.133 |
| 995.7 | 0.134 |
| 995.75 | 0.134 |
| 995.8 | 0.132 |
| 995.85 | 0.131 |
| 995.9 | 0.13 |
| 995.95 | 0.13 |
| 996.0 | 0.129 |
| 996.05 | 0.128 |
| 996.1 | 0.127 |
| 996.15 | 0.127 |
| 996.2 | 0.126 |
| 996.25 | 0.124 |
| 996.3 | 0.124 |
| 996.35 | 0.123 |
| 996.4 | 0.123 |
| 996.45 | 0.124 |
| 996.5 | 0.123 |
| 996.55 | 0.122 |
| 996.6 | 0.122 |
| 996.65 | 0.122 |
| 996.7 | 0.121 |
| 996.75 | 0.119 |
| 996.8 | 0.119 |
| 996.85 | 0.118 |
| 996.9 | 0.118 |
| 996.95 | 0.116 |
| 997.0 | 0.114 |
| 997.05 | 0.113 |
| 997.1 | 0.112 |
| 997.15 | 0.111 |
| 997.2 | 0.109 |
| 997.25 | 0.109 |
| 997.3 | 0.109 |
| 997.35 | 0.109 |
| 997.4 | 0.107 |
| 997.45 | 0.107 |
| 997.5 | 0.108 |
| 997.55 | 0.108 |
| 997.6 | 0.109 |
| 997.65 | 0.109 |
| 997.7 | 0.109 |
| 997.75 | 0.108 |
| 997.8 | 0.108 |
| 997.85 | 0.106 |
| 997.9 | 0.105 |
| 997.95 | 0.107 |
| 998.0 | 0.105 |
| 998.05 | 0.105 |
| 998.1 | 0.103 |
| 998.15 | 0.102 |
| 998.2 | 0.102 |
| 998.25 | 0.101 |
| 998.3 | 0.101 |
| 998.35 | 0.101 |
| 998.4 | 0.101 |
| 998.45 | 0.101 |
| 998.5 | 0.1 |
| 998.55 | 0.099 |
| 998.6 | 0.099 |
| 998.65 | 0.099 |
| 998.7 | 0.098 |
| 998.75 | 0.097 |
| 998.8 | 0.098 |
| 998.85 | 0.097 |
| 998.9 | 0.096 |
| 998.95 | 0.095 |
| 999.0 | 0.095 |
| 999.05 | 0.094 |
| 999.1 | 0.093 |
| 999.15 | 0.091 |
| 999.2 | 0.091 |
| 999.25 | 0.091 |
| 999.3 | 0.091 |
| 999.35 | 0.09 |
| 999.4 | 0.09 |
| 999.45 | 0.09 |
| 999.5 | 0.089 |
| 999.55 | 0.089 |
| 999.6 | 0.089 |
| 999.65 | 0.09 |
| 999.7 | 0.09 |
| 999.75 | 0.091 |
| 999.8 | 0.092 |
| 999.85 | 0.091 |
| 999.9 | 0.091 |
| 999.95 | 0.091 |
| 1000.0 | 0.091 |
| 1000.05 | 0.091 |
| 1000.1 | 0.091 |
| 1000.15 | 0.09 |
| 1000.2 | 0.09 |
| 1000.25 | 0.09 |
| 1000.3 | 0.089 |
| 1000.35 | 0.088 |
| 1000.4 | 0.089 |
| 1000.45 | 0.089 |
| 1000.5 | 0.089 |
| 1000.55 | 0.087 |
| 1000.6 | 0.086 |
| 1000.65 | 0.085 |
| 1000.7 | 0.087 |
| 1000.75 | 0.086 |
| 1000.8 | 0.086 |
| 1000.85 | 0.086 |
| 1000.9 | 0.085 |
| 1000.95 | 0.085 |
| 1001.0 | 0.083 |
| 1001.05 | 0.084 |
| 1001.1 | 0.085 |
| 1001.15 | 0.086 |
| 1001.2 | 0.086 |
| 1001.25 | 0.085 |
| 1001.3 | 0.085 |
| 1001.35 | 0.085 |
| 1001.4 | 0.084 |
| 1001.45 | 0.084 |
| 1001.5 | 0.083 |
| 1001.55 | 0.084 |
| 1001.6 | 0.084 |
| 1001.65 | 0.084 |
| 1001.7 | 0.084 |
| 1001.75 | 0.083 |
| 1001.8 | 0.083 |
| 1001.85 | 0.083 |
| 1001.9 | 0.081 |
| 1001.95 | 0.081 |
| 1002.0 | 0.082 |
| 1002.05 | 0.081 |
| 1002.1 | 0.08 |
| 1002.15 | 0.08 |
| 1002.2 | 0.079 |
| 1002.25 | 0.079 |
| 1002.3 | 0.08 |
| 1002.35 | 0.08 |
| 1002.4 | 0.08 |
| 1002.45 | 0.082 |
| 1002.5 | 0.083 |
| 1002.55 | 0.083 |
| 1002.6 | 0.084 |
| 1002.65 | 0.085 |
| 1002.7 | 0.085 |
| 1002.75 | 0.085 |
| 1002.8 | 0.085 |
| 1002.85 | 0.085 |
| 1002.9 | 0.084 |
| 1002.95 | 0.085 |
| 1003.0 | 0.083 |
| 1003.05 | 0.084 |
| 1003.1 | 0.084 |
| 1003.15 | 0.084 |
| 1003.2 | 0.083 |
| 1003.25 | 0.082 |
| 1003.3 | 0.082 |
| 1003.35 | 0.083 |
| 1003.4 | 0.083 |
| 1003.45 | 0.083 |
| 1003.5 | 0.083 |
| 1003.55 | 0.083 |
| 1003.6 | 0.082 |
| 1003.65 | 0.083 |
| 1003.7 | 0.082 |
| 1003.75 | 0.083 |
| 1003.8 | 0.083 |
| 1003.85 | 0.082 |
| 1003.9 | 0.082 |
| 1003.95 | 0.083 |
| 1004.0 | 0.084 |
| 1004.05 | 0.084 |
| 1004.1 | 0.085 |
| 1004.15 | 0.085 |
| 1004.2 | 0.085 |
| 1004.25 | 0.086 |
| 1004.3 | 0.086 |
| 1004.35 | 0.085 |
| 1004.4 | 0.087 |
| 1004.45 | 0.089 |
| 1004.5 | 0.09 |
| 1004.55 | 0.09 |
| 1004.6 | 0.09 |
| 1004.65 | 0.09 |
| 1004.7 | 0.09 |
| 1004.75 | 0.091 |
| 1004.8 | 0.091 |
| 1004.85 | 0.092 |
| 1004.9 | 0.093 |
| 1004.95 | 0.093 |
| 1005.0 | 0.092 |
| 1005.05 | 0.091 |
| 1005.1 | 0.092 |
| 1005.15 | 0.092 |
| 1005.2 | 0.092 |
| 1005.25 | 0.093 |
| 1005.3 | 0.093 |
| 1005.35 | 0.093 |
| 1005.4 | 0.094 |
| 1005.45 | 0.094 |
| 1005.5 | 0.094 |
| 1005.55 | 0.096 |
| 1005.6 | 0.098 |
| 1005.65 | 0.098 |
| 1005.7 | 0.099 |
| 1005.75 | 0.098 |
| 1005.8 | 0.099 |
| 1005.85 | 0.1 |
| 1005.9 | 0.101 |
| 1005.95 | 0.102 |
| 1006.0 | 0.103 |
| 1006.05 | 0.103 |
| 1006.1 | 0.103 |
| 1006.15 | 0.102 |
| 1006.2 | 0.102 |
| 1006.25 | 0.103 |
| 1006.3 | 0.104 |
| 1006.35 | 0.104 |
| 1006.4 | 0.104 |
| 1006.45 | 0.103 |
| 1006.5 | 0.103 |
| 1006.55 | 0.103 |
| 1006.6 | 0.102 |
| 1006.65 | 0.103 |
| 1006.7 | 0.103 |
| 1006.75 | 0.102 |
| 1006.8 | 0.102 |
| 1006.85 | 0.102 |
| 1006.9 | 0.102 |
| 1006.95 | 0.101 |
| 1007.0 | 0.101 |
| 1007.05 | 0.101 |
| 1007.1 | 0.1 |
| 1007.15 | 0.101 |
| 1007.2 | 0.101 |
| 1007.25 | 0.102 |
| 1007.3 | 0.102 |
| 1007.35 | 0.101 |
| 1007.4 | 0.102 |
| 1007.45 | 0.102 |
| 1007.5 | 0.102 |
| 1007.55 | 0.103 |
| 1007.6 | 0.104 |
| 1007.65 | 0.104 |
| 1007.7 | 0.104 |
| 1007.75 | 0.104 |
| 1007.8 | 0.103 |
| 1007.85 | 0.103 |
| 1007.9 | 0.103 |
| 1007.95 | 0.103 |
| 1008.0 | 0.103 |
| 1008.05 | 0.104 |
| 1008.1 | 0.104 |
| 1008.15 | 0.104 |
| 1008.2 | 0.104 |
| 1008.25 | 0.104 |
| 1008.3 | 0.105 |
| 1008.35 | 0.105 |
| 1008.4 | 0.106 |
| 1008.45 | 0.107 |
| 1008.5 | 0.107 |
| 1008.55 | 0.106 |
| 1008.6 | 0.105 |
| 1008.65 | 0.104 |
| 1008.7 | 0.104 |
| 1008.75 | 0.105 |
| 1008.8 | 0.105 |
| 1008.85 | 0.104 |
| 1008.9 | 0.105 |
| 1008.95 | 0.104 |
| 1009.0 | 0.103 |
| 1009.05 | 0.103 |
| 1009.1 | 0.104 |
| 1009.15 | 0.104 |
| 1009.2 | 0.104 |
| 1009.25 | 0.103 |
| 1009.3 | 0.102 |
| 1009.35 | 0.102 |
| 1009.4 | 0.103 |
| 1009.45 | 0.103 |
| 1009.5 | 0.103 |
| 1009.55 | 0.103 |
| 1009.6 | 0.102 |
| 1009.65 | 0.103 |
| 1009.7 | 0.104 |
| 1009.75 | 0.105 |
| 1009.8 | 0.106 |
| 1009.85 | 0.105 |
| 1009.9 | 0.106 |
| 1009.95 | 0.105 |
| 1010.0 | 0.105 |
| 1010.05 | 0.105 |
| 1010.1 | 0.105 |
| 1010.15 | 0.107 |
| 1010.2 | 0.107 |
| 1010.25 | 0.106 |
| 1010.3 | 0.105 |
| 1010.35 | 0.105 |
| 1010.4 | 0.106 |
| 1010.45 | 0.105 |
| 1010.5 | 0.105 |
| 1010.55 | 0.106 |
| 1010.6 | 0.106 |
| 1010.65 | 0.105 |
| 1010.7 | 0.105 |
| 1010.75 | 0.103 |
| 1010.8 | 0.103 |
| 1010.85 | 0.103 |
| 1010.9 | 0.102 |
| 1010.95 | 0.102 |
| 1011.0 | 0.102 |
| 1011.05 | 0.101 |
| 1011.1 | 0.1 |
| 1011.15 | 0.098 |
| 1011.2 | 0.098 |
| 1011.25 | 0.098 |
| 1011.3 | 0.098 |
| 1011.35 | 0.099 |
| 1011.4 | 0.099 |
| 1011.45 | 0.099 |
| 1011.5 | 0.099 |
| 1011.55 | 0.099 |
| 1011.6 | 0.099 |
| 1011.65 | 0.099 |
| 1011.7 | 0.1 |
| 1011.75 | 0.101 |
| 1011.8 | 0.101 |
| 1011.85 | 0.103 |
| 1011.9 | 0.103 |
| 1011.95 | 0.102 |
| 1012.0 | 0.103 |
| 1012.05 | 0.103 |
| 1012.1 | 0.104 |
| 1012.15 | 0.104 |
| 1012.2 | 0.104 |
| 1012.25 | 0.104 |
| 1012.3 | 0.103 |
| 1012.35 | 0.103 |
| 1012.4 | 0.103 |
| 1012.45 | 0.102 |
| 1012.5 | 0.102 |
| 1012.55 | 0.102 |
| 1012.6 | 0.101 |
| 1012.65 | 0.1 |
| 1012.7 | 0.101 |
| 1012.75 | 0.101 |
| 1012.8 | 0.101 |
| 1012.85 | 0.101 |
| 1012.9 | 0.101 |
| 1012.95 | 0.101 |
| 1013.0 | 0.102 |
| 1013.05 | 0.102 |
| 1013.1 | 0.101 |
| 1013.15 | 0.101 |
| 1013.2 | 0.103 |
| 1013.25 | 0.102 |
| 1013.3 | 0.103 |
| 1013.35 | 0.103 |
| 1013.4 | 0.103 |
| 1013.45 | 0.103 |
| 1013.5 | 0.103 |
| 1013.55 | 0.102 |
| 1013.6 | 0.102 |
| 1013.65 | 0.103 |
| 1013.7 | 0.103 |
| 1013.75 | 0.101 |
| 1013.8 | 0.1 |
| 1013.85 | 0.1 |
| 1013.9 | 0.101 |
| 1013.95 | 0.101 |
| 1014.0 | 0.101 |
| 1014.05 | 0.101 |
| 1014.1 | 0.101 |
| 1014.15 | 0.101 |
| 1014.2 | 0.101 |
| 1014.25 | 0.1 |
| 1014.3 | 0.1 |
| 1014.35 | 0.101 |
| 1014.4 | 0.1 |
| 1014.45 | 0.101 |
| 1014.5 | 0.1 |
| 1014.55 | 0.099 |
| 1014.6 | 0.1 |
| 1014.65 | 0.101 |
| 1014.7 | 0.101 |
| 1014.75 | 0.1 |
| 1014.8 | 0.101 |
| 1014.85 | 0.102 |
| 1014.9 | 0.101 |
| 1014.95 | 0.102 |
| 1015.0 | 0.101 |
| 1015.05 | 0.101 |
| 1015.1 | 0.102 |
| 1015.15 | 0.1 |
| 1015.2 | 0.1 |
| 1015.25 | 0.099 |
| 1015.3 | 0.098 |
| 1015.35 | 0.098 |
| 1015.4 | 0.098 |
| 1015.45 | 0.098 |
| 1015.5 | 0.096 |
| 1015.55 | 0.097 |
| 1015.6 | 0.096 |
| 1015.65 | 0.094 |
| 1015.7 | 0.094 |
| 1015.75 | 0.093 |
| 1015.8 | 0.093 |
| 1015.85 | 0.093 |
| 1015.9 | 0.092 |
| 1015.95 | 0.092 |
| 1016.0 | 0.092 |
| 1016.05 | 0.092 |
| 1016.1 | 0.091 |
| 1016.15 | 0.092 |
| 1016.2 | 0.093 |
| 1016.25 | 0.092 |
| 1016.3 | 0.093 |
| 1016.35 | 0.093 |
| 1016.4 | 0.093 |
| 1016.45 | 0.092 |
| 1016.5 | 0.092 |
| 1016.55 | 0.093 |
| 1016.6 | 0.092 |
| 1016.65 | 0.092 |
| 1016.7 | 0.092 |
| 1016.75 | 0.092 |
| 1016.8 | 0.091 |
| 1016.85 | 0.091 |
| 1016.9 | 0.089 |
| 1016.95 | 0.089 |
| 1017.0 | 0.088 |
| 1017.05 | 0.088 |
| 1017.1 | 0.088 |
| 1017.15 | 0.088 |
| 1017.2 | 0.088 |
| 1017.25 | 0.087 |
| 1017.3 | 0.086 |
| 1017.35 | 0.086 |
| 1017.4 | 0.086 |
| 1017.45 | 0.088 |
| 1017.5 | 0.088 |
| 1017.55 | 0.088 |
| 1017.6 | 0.088 |
| 1017.65 | 0.088 |
| 1017.7 | 0.088 |
| 1017.75 | 0.089 |
| 1017.8 | 0.09 |
| 1017.85 | 0.09 |
| 1017.9 | 0.089 |
| 1017.95 | 0.089 |
| 1018.0 | 0.088 |
| 1018.05 | 0.088 |
| 1018.1 | 0.088 |
| 1018.15 | 0.089 |
| 1018.2 | 0.089 |
| 1018.25 | 0.088 |
| 1018.3 | 0.086 |
| 1018.35 | 0.086 |
| 1018.4 | 0.086 |
| 1018.45 | 0.085 |
| 1018.5 | 0.085 |
| 1018.55 | 0.085 |
| 1018.6 | 0.084 |
| 1018.65 | 0.084 |
| 1018.7 | 0.082 |
| 1018.75 | 0.082 |
| 1018.8 | 0.081 |
| 1018.85 | 0.081 |
| 1018.9 | 0.081 |
| 1018.95 | 0.08 |
| 1019.0 | 0.08 |
| 1019.05 | 0.08 |
| 1019.1 | 0.081 |
| 1019.15 | 0.081 |
| 1019.2 | 0.08 |
| 1019.25 | 0.08 |
| 1019.3 | 0.08 |
| 1019.35 | 0.08 |
| 1019.4 | 0.079 |
| 1019.45 | 0.08 |
| 1019.5 | 0.08 |
| 1019.55 | 0.079 |
| 1019.6 | 0.079 |
| 1019.65 | 0.078 |
| 1019.7 | 0.077 |
| 1019.75 | 0.078 |
| 1019.8 | 0.079 |
| 1019.85 | 0.078 |
| 1019.9 | 0.079 |
| 1019.95 | 0.078 |
| 1020.0 | 0.077 |
| 1020.05 | 0.077 |
| 1020.1 | 0.077 |
| 1020.15 | 0.077 |
| 1020.2 | 0.077 |
| 1020.25 | 0.078 |
| 1020.3 | 0.077 |
| 1020.35 | 0.076 |
| 1020.4 | 0.076 |
| 1020.45 | 0.076 |
| 1020.5 | 0.075 |
| 1020.55 | 0.077 |
| 1020.6 | 0.077 |
| 1020.65 | 0.078 |
| 1020.7 | 0.077 |
| 1020.75 | 0.077 |
| 1020.8 | 0.078 |
| 1020.85 | 0.078 |
| 1020.9 | 0.079 |
| 1020.95 | 0.079 |
| 1021.0 | 0.08 |
| 1021.05 | 0.081 |
| 1021.1 | 0.079 |
| 1021.15 | 0.079 |
| 1021.2 | 0.079 |
| 1021.25 | 0.079 |
| 1021.3 | 0.078 |
| 1021.35 | 0.078 |
| 1021.4 | 0.078 |
| 1021.45 | 0.078 |
| 1021.5 | 0.078 |
| 1021.55 | 0.079 |
| 1021.6 | 0.079 |
| 1021.65 | 0.079 |
| 1021.7 | 0.081 |
| 1021.75 | 0.08 |
| 1021.8 | 0.081 |
| 1021.85 | 0.082 |
| 1021.9 | 0.082 |
| 1021.95 | 0.082 |
| 1022.0 | 0.082 |
| 1022.05 | 0.082 |
| 1022.1 | 0.081 |
| 1022.15 | 0.081 |
| 1022.2 | 0.082 |
| 1022.25 | 0.082 |
| 1022.3 | 0.083 |
| 1022.35 | 0.083 |
| 1022.4 | 0.083 |
| 1022.45 | 0.082 |
| 1022.5 | 0.083 |
| 1022.55 | 0.082 |
| 1022.6 | 0.082 |
| 1022.65 | 0.082 |
| 1022.7 | 0.084 |
| 1022.75 | 0.084 |
| 1022.8 | 0.083 |
| 1022.85 | 0.085 |
| 1022.9 | 0.085 |
| 1022.95 | 0.085 |
| 1023.0 | 0.085 |
| 1023.05 | 0.085 |
| 1023.1 | 0.085 |
| 1023.15 | 0.084 |
| 1023.2 | 0.084 |
| 1023.25 | 0.083 |
| 1023.3 | 0.082 |
| 1023.35 | 0.083 |
| 1023.4 | 0.081 |
| 1023.45 | 0.08 |
| 1023.5 | 0.081 |
| 1023.55 | 0.082 |
| 1023.6 | 0.081 |
| 1023.65 | 0.082 |
| 1023.7 | 0.084 |
| 1023.75 | 0.084 |
| 1023.8 | 0.084 |
| 1023.85 | 0.084 |
| 1023.9 | 0.084 |
| 1023.95 | 0.083 |
| 1024.0 | 0.084 |
| 1024.05 | 0.084 |
| 1024.1 | 0.084 |
| 1024.15 | 0.084 |
| 1024.2 | 0.084 |
| 1024.25 | 0.084 |
| 1024.3 | 0.084 |
| 1024.35 | 0.083 |
| 1024.4 | 0.083 |
| 1024.45 | 0.082 |
| 1024.5 | 0.083 |
| 1024.55 | 0.084 |
| 1024.6 | 0.085 |
| 1024.65 | 0.083 |
| 1024.7 | 0.082 |
| 1024.75 | 0.082 |
| 1024.8 | 0.081 |
| 1024.85 | 0.08 |
| 1024.9 | 0.081 |
| 1024.95 | 0.081 |
| 1025.0 | 0.082 |
| 1025.05 | 0.081 |
| 1025.1 | 0.08 |
| 1025.15 | 0.08 |
| 1025.2 | 0.081 |
| 1025.25 | 0.081 |
| 1025.3 | 0.081 |
| 1025.35 | 0.08 |
| 1025.4 | 0.081 |
| 1025.45 | 0.081 |
| 1025.5 | 0.08 |
| 1025.55 | 0.081 |
| 1025.6 | 0.082 |
| 1025.65 | 0.082 |
| 1025.7 | 0.081 |
| 1025.75 | 0.081 |
| 1025.8 | 0.082 |
| 1025.85 | 0.083 |
| 1025.9 | 0.085 |
| 1025.95 | 0.086 |
| 1026.0 | 0.086 |
| 1026.05 | 0.086 |
| 1026.1 | 0.087 |
| 1026.15 | 0.087 |
| 1026.2 | 0.087 |
| 1026.25 | 0.086 |
| 1026.3 | 0.087 |
| 1026.35 | 0.088 |
| 1026.4 | 0.087 |
| 1026.45 | 0.087 |
| 1026.5 | 0.086 |
| 1026.55 | 0.085 |
| 1026.6 | 0.085 |
| 1026.65 | 0.085 |
| 1026.7 | 0.085 |
| 1026.75 | 0.085 |
| 1026.8 | 0.085 |
| 1026.85 | 0.084 |
| 1026.9 | 0.084 |
| 1026.95 | 0.085 |
| 1027.0 | 0.086 |
| 1027.05 | 0.086 |
| 1027.1 | 0.087 |
| 1027.15 | 0.087 |
| 1027.2 | 0.087 |
| 1027.25 | 0.087 |
| 1027.3 | 0.088 |
| 1027.35 | 0.088 |
| 1027.4 | 0.087 |
| 1027.45 | 0.087 |
| 1027.5 | 0.087 |
| 1027.55 | 0.086 |
| 1027.6 | 0.087 |
| 1027.65 | 0.088 |
| 1027.7 | 0.088 |
| 1027.75 | 0.088 |
| 1027.8 | 0.088 |
| 1027.85 | 0.087 |
| 1027.9 | 0.088 |
| 1027.95 | 0.089 |
| 1028.0 | 0.09 |
| 1028.05 | 0.09 |
| 1028.1 | 0.09 |
| 1028.15 | 0.09 |
| 1028.2 | 0.09 |
| 1028.25 | 0.089 |
| 1028.3 | 0.09 |
| 1028.35 | 0.091 |
| 1028.4 | 0.092 |
| 1028.45 | 0.092 |
| 1028.5 | 0.092 |
| 1028.55 | 0.092 |
| 1028.6 | 0.092 |
| 1028.65 | 0.092 |
| 1028.7 | 0.091 |
| 1028.75 | 0.091 |
| 1028.8 | 0.092 |
| 1028.85 | 0.091 |
| 1028.9 | 0.091 |
| 1028.95 | 0.091 |
| 1029.0 | 0.09 |
| 1029.05 | 0.091 |
| 1029.1 | 0.091 |
| 1029.15 | 0.091 |
| 1029.2 | 0.091 |
| 1029.25 | 0.091 |
| 1029.3 | 0.092 |
| 1029.35 | 0.092 |
| 1029.4 | 0.094 |
| 1029.45 | 0.094 |
| 1029.5 | 0.093 |
| 1029.55 | 0.094 |
| 1029.6 | 0.094 |
| 1029.65 | 0.094 |
| 1029.7 | 0.093 |
| 1029.75 | 0.094 |
| 1029.8 | 0.093 |
| 1029.85 | 0.093 |
| 1029.9 | 0.093 |
| 1029.95 | 0.092 |
| 1030.0 | 0.093 |
| 1030.05 | 0.093 |
| 1030.1 | 0.093 |
| 1030.15 | 0.093 |
| 1030.2 | 0.093 |
| 1030.25 | 0.094 |
| 1030.3 | 0.095 |
| 1030.35 | 0.096 |
| 1030.4 | 0.096 |
| 1030.45 | 0.096 |
| 1030.5 | 0.096 |
| 1030.55 | 0.096 |
| 1030.6 | 0.097 |
| 1030.65 | 0.098 |
| 1030.7 | 0.098 |
| 1030.75 | 0.098 |
| 1030.8 | 0.098 |
| 1030.85 | 0.098 |
| 1030.9 | 0.097 |
| 1030.95 | 0.098 |
| 1031.0 | 0.099 |
| 1031.05 | 0.1 |
| 1031.1 | 0.099 |
| 1031.15 | 0.099 |
| 1031.2 | 0.099 |
| 1031.25 | 0.099 |
| 1031.3 | 0.1 |
| 1031.35 | 0.099 |
| 1031.4 | 0.099 |
| 1031.45 | 0.1 |
| 1031.5 | 0.102 |
| 1031.55 | 0.102 |
| 1031.6 | 0.102 |
| 1031.65 | 0.102 |
| 1031.7 | 0.103 |
| 1031.75 | 0.104 |
| 1031.8 | 0.104 |
| 1031.85 | 0.104 |
| 1031.9 | 0.105 |
| 1031.95 | 0.105 |
| 1032.0 | 0.106 |
| 1032.05 | 0.105 |
| 1032.1 | 0.105 |
| 1032.15 | 0.107 |
| 1032.2 | 0.108 |
| 1032.25 | 0.108 |
| 1032.3 | 0.109 |
| 1032.35 | 0.111 |
| 1032.4 | 0.112 |
| 1032.45 | 0.111 |
| 1032.5 | 0.112 |
| 1032.55 | 0.113 |
| 1032.6 | 0.115 |
| 1032.65 | 0.115 |
| 1032.7 | 0.115 |
| 1032.75 | 0.116 |
| 1032.8 | 0.116 |
| 1032.85 | 0.117 |
| 1032.9 | 0.117 |
| 1032.95 | 0.118 |
| 1033.0 | 0.12 |
| 1033.05 | 0.12 |
| 1033.1 | 0.121 |
| 1033.15 | 0.121 |
| 1033.2 | 0.121 |
| 1033.25 | 0.123 |
| 1033.3 | 0.123 |
| 1033.35 | 0.123 |
| 1033.4 | 0.124 |
| 1033.45 | 0.125 |
| 1033.5 | 0.126 |
| 1033.55 | 0.126 |
| 1033.6 | 0.125 |
| 1033.65 | 0.125 |
| 1033.7 | 0.125 |
| 1033.75 | 0.125 |
| 1033.8 | 0.125 |
| 1033.85 | 0.126 |
| 1033.9 | 0.127 |
| 1033.95 | 0.126 |
| 1034.0 | 0.126 |
| 1034.05 | 0.126 |
| 1034.1 | 0.126 |
| 1034.15 | 0.128 |
| 1034.2 | 0.127 |
| 1034.25 | 0.128 |
| 1034.3 | 0.128 |
| 1034.35 | 0.128 |
| 1034.4 | 0.127 |
| 1034.45 | 0.127 |
| 1034.5 | 0.126 |
| 1034.55 | 0.127 |
| 1034.6 | 0.127 |
| 1034.65 | 0.127 |
| 1034.7 | 0.127 |
| 1034.75 | 0.127 |
| 1034.8 | 0.126 |
| 1034.85 | 0.126 |
| 1034.9 | 0.126 |
| 1034.95 | 0.127 |
| 1035.0 | 0.128 |
| 1035.05 | 0.127 |
| 1035.1 | 0.126 |
| 1035.15 | 0.125 |
| 1035.2 | 0.125 |
| 1035.25 | 0.124 |
| 1035.3 | 0.125 |
| 1035.35 | 0.124 |
| 1035.4 | 0.123 |
| 1035.45 | 0.123 |
| 1035.5 | 0.122 |
| 1035.55 | 0.122 |
| 1035.6 | 0.122 |
| 1035.65 | 0.121 |
| 1035.7 | 0.12 |
| 1035.75 | 0.119 |
| 1035.8 | 0.119 |
| 1035.85 | 0.117 |
| 1035.9 | 0.118 |
| 1035.95 | 0.117 |
| 1036.0 | 0.117 |
| 1036.05 | 0.116 |
| 1036.1 | 0.115 |
| 1036.15 | 0.115 |
| 1036.2 | 0.114 |
| 1036.25 | 0.114 |
| 1036.3 | 0.114 |
| 1036.35 | 0.114 |
| 1036.4 | 0.115 |
| 1036.45 | 0.114 |
| 1036.5 | 0.113 |
| 1036.55 | 0.111 |
| 1036.6 | 0.11 |
| 1036.65 | 0.111 |
| 1036.7 | 0.109 |
| 1036.75 | 0.109 |
| 1036.8 | 0.109 |
| 1036.85 | 0.109 |
| 1036.9 | 0.108 |
| 1036.95 | 0.107 |
| 1037.0 | 0.105 |
| 1037.05 | 0.105 |
| 1037.1 | 0.106 |
| 1037.15 | 0.105 |
| 1037.2 | 0.105 |
| 1037.25 | 0.105 |
| 1037.3 | 0.104 |
| 1037.35 | 0.103 |
| 1037.4 | 0.101 |
| 1037.45 | 0.1 |
| 1037.5 | 0.1 |
| 1037.55 | 0.1 |
| 1037.6 | 0.099 |
| 1037.65 | 0.098 |
| 1037.7 | 0.097 |
| 1037.75 | 0.097 |
| 1037.8 | 0.096 |
| 1037.85 | 0.096 |
| 1037.9 | 0.096 |
| 1037.95 | 0.095 |
| 1038.0 | 0.095 |
| 1038.05 | 0.094 |
| 1038.1 | 0.094 |
| 1038.15 | 0.094 |
| 1038.2 | 0.094 |
| 1038.25 | 0.094 |
| 1038.3 | 0.092 |
| 1038.35 | 0.092 |
| 1038.4 | 0.09 |
| 1038.45 | 0.089 |
| 1038.5 | 0.089 |
| 1038.55 | 0.088 |
| 1038.6 | 0.087 |
| 1038.65 | 0.086 |
| 1038.7 | 0.086 |
| 1038.75 | 0.085 |
| 1038.8 | 0.084 |
| 1038.85 | 0.083 |
| 1038.9 | 0.082 |
| 1038.95 | 0.081 |
| 1039.0 | 0.082 |
| 1039.05 | 0.08 |
| 1039.1 | 0.079 |
| 1039.15 | 0.079 |
| 1039.2 | 0.078 |
| 1039.25 | 0.078 |
| 1039.3 | 0.077 |
| 1039.35 | 0.077 |
| 1039.4 | 0.078 |
| 1039.45 | 0.078 |
| 1039.5 | 0.077 |
| 1039.55 | 0.076 |
| 1039.6 | 0.076 |
| 1039.65 | 0.076 |
| 1039.7 | 0.077 |
| 1039.75 | 0.077 |
| 1039.8 | 0.077 |
| 1039.85 | 0.076 |
| 1039.9 | 0.076 |
| 1039.95 | 0.076 |
| 1040.0 | 0.075 |
| 1040.05 | 0.076 |
| 1040.1 | 0.075 |
| 1040.15 | 0.075 |
| 1040.2 | 0.074 |
| 1040.25 | 0.073 |
| 1040.3 | 0.072 |
| 1040.35 | 0.071 |
| 1040.4 | 0.07 |
| 1040.45 | 0.068 |
| 1040.5 | 0.068 |
| 1040.55 | 0.068 |
| 1040.6 | 0.066 |
| 1040.65 | 0.066 |
| 1040.7 | 0.065 |
| 1040.75 | 0.064 |
| 1040.8 | 0.063 |
| 1040.85 | 0.063 |
| 1040.9 | 0.064 |
| 1040.95 | 0.064 |
| 1041.0 | 0.063 |
| 1041.05 | 0.062 |
| 1041.1 | 0.063 |
| 1041.15 | 0.063 |
| 1041.2 | 0.062 |
| 1041.25 | 0.064 |
| 1041.3 | 0.064 |
| 1041.35 | 0.064 |
| 1041.4 | 0.064 |
| 1041.45 | 0.064 |
| 1041.5 | 0.064 |
| 1041.55 | 0.064 |
| 1041.6 | 0.064 |
| 1041.65 | 0.063 |
| 1041.7 | 0.062 |
| 1041.75 | 0.061 |
| 1041.8 | 0.059 |
| 1041.85 | 0.059 |
| 1041.9 | 0.058 |
| 1041.95 | 0.057 |
| 1042.0 | 0.056 |
| 1042.05 | 0.054 |
| 1042.1 | 0.053 |
| 1042.15 | 0.053 |
| 1042.2 | 0.054 |
| 1042.25 | 0.054 |
| 1042.3 | 0.054 |
| 1042.35 | 0.054 |
| 1042.4 | 0.054 |
| 1042.45 | 0.053 |
| 1042.5 | 0.053 |
| 1042.55 | 0.053 |
| 1042.6 | 0.054 |
| 1042.65 | 0.053 |
| 1042.7 | 0.052 |
| 1042.75 | 0.051 |
| 1042.8 | 0.051 |
| 1042.85 | 0.051 |
| 1042.9 | 0.05 |
| 1042.95 | 0.05 |
| 1043.0 | 0.05 |
| 1043.05 | 0.049 |
| 1043.1 | 0.049 |
| 1043.15 | 0.049 |
| 1043.2 | 0.049 |
| 1043.25 | 0.049 |
| 1043.3 | 0.049 |
| 1043.35 | 0.047 |
| 1043.4 | 0.047 |
| 1043.45 | 0.047 |
| 1043.5 | 0.047 |
| 1043.55 | 0.048 |
| 1043.6 | 0.048 |
| 1043.65 | 0.045 |
| 1043.7 | 0.044 |
| 1043.75 | 0.044 |
| 1043.8 | 0.044 |
| 1043.85 | 0.044 |
| 1043.9 | 0.044 |
| 1043.95 | 0.043 |
| 1044.0 | 0.043 |
| 1044.05 | 0.04 |
| 1044.1 | 0.04 |
| 1044.15 | 0.039 |
| 1044.2 | 0.038 |
| 1044.25 | 0.039 |
| 1044.3 | 0.039 |
| 1044.35 | 0.039 |
| 1044.4 | 0.039 |
| 1044.45 | 0.04 |
| 1044.5 | 0.04 |
| 1044.55 | 0.04 |
| 1044.6 | 0.041 |
| 1044.65 | 0.04 |
| 1044.7 | 0.04 |
| 1044.75 | 0.041 |
| 1044.8 | 0.04 |
| 1044.85 | 0.04 |
| 1044.9 | 0.04 |
| 1044.95 | 0.038 |
| 1045.0 | 0.037 |
| 1045.05 | 0.036 |
| 1045.1 | 0.036 |
| 1045.15 | 0.036 |
| 1045.2 | 0.036 |
| 1045.25 | 0.036 |
| 1045.3 | 0.036 |
| 1045.35 | 0.036 |
| 1045.4 | 0.035 |
| 1045.45 | 0.034 |
| 1045.5 | 0.034 |
| 1045.55 | 0.034 |
| 1045.6 | 0.035 |
| 1045.65 | 0.036 |
| 1045.7 | 0.036 |
| 1045.75 | 0.035 |
| 1045.8 | 0.035 |
| 1045.85 | 0.035 |
| 1045.9 | 0.035 |
| 1045.95 | 0.034 |
| 1046.0 | 0.035 |
| 1046.05 | 0.035 |
| 1046.1 | 0.034 |
| 1046.15 | 0.033 |
| 1046.2 | 0.033 |
| 1046.25 | 0.032 |
| 1046.3 | 0.034 |
| 1046.35 | 0.033 |
| 1046.4 | 0.032 |
| 1046.45 | 0.032 |
| 1046.5 | 0.031 |
| 1046.55 | 0.03 |
| 1046.6 | 0.03 |
| 1046.65 | 0.03 |
| 1046.7 | 0.03 |
| 1046.75 | 0.03 |
| 1046.8 | 0.03 |
| 1046.85 | 0.028 |
| 1046.9 | 0.028 |
| 1046.95 | 0.028 |
| 1047.0 | 0.028 |
| 1047.05 | 0.028 |
| 1047.1 | 0.028 |
| 1047.15 | 0.027 |
| 1047.2 | 0.027 |
| 1047.25 | 0.027 |
| 1047.3 | 0.026 |
| 1047.35 | 0.026 |
| 1047.4 | 0.025 |
| 1047.45 | 0.026 |
| 1047.5 | 0.026 |
| 1047.55 | 0.026 |
| 1047.6 | 0.027 |
| 1047.65 | 0.027 |
| 1047.7 | 0.027 |
| 1047.75 | 0.027 |
| 1047.8 | 0.027 |
| 1047.85 | 0.026 |
| 1047.9 | 0.026 |
| 1047.95 | 0.027 |
| 1048.0 | 0.026 |
| 1048.05 | 0.025 |
| 1048.1 | 0.025 |
| 1048.15 | 0.025 |
| 1048.2 | 0.025 |
| 1048.25 | 0.025 |
| 1048.3 | 0.025 |
| 1048.35 | 0.025 |
| 1048.4 | 0.025 |
| 1048.45 | 0.025 |
| 1048.5 | 0.024 |
| 1048.55 | 0.023 |
| 1048.6 | 0.025 |
| 1048.65 | 0.025 |
| 1048.7 | 0.024 |
| 1048.75 | 0.025 |
| 1048.8 | 0.025 |
| 1048.85 | 0.025 |
| 1048.9 | 0.024 |
| 1048.95 | 0.024 |
| 1049.0 | 0.024 |
| 1049.05 | 0.023 |
| 1049.1 | 0.023 |
| 1049.15 | 0.021 |
| 1049.2 | 0.021 |
| 1049.25 | 0.022 |
| 1049.3 | 0.022 |
| 1049.35 | 0.021 |
| 1049.4 | 0.021 |
| 1049.45 | 0.021 |
| 1049.5 | 0.021 |
| 1049.55 | 0.023 |
| 1049.6 | 0.023 |
| 1049.65 | 0.022 |
| 1049.7 | 0.022 |
| 1049.75 | 0.022 |
| 1049.8 | 0.022 |
| 1049.85 | 0.021 |
| 1049.9 | 0.022 |
| 1049.95 | 0.022 |
| 1050.0 | 0.021 |
| 1050.05 | 0.022 |
| 1050.1 | 0.021 |
| 1050.15 | 0.022 |
| 1050.2 | 0.022 |
| 1050.25 | 0.022 |
| 1050.3 | 0.022 |
| 1050.35 | 0.021 |
| 1050.4 | 0.022 |
| 1050.45 | 0.021 |
| 1050.5 | 0.021 |
| 1050.55 | 0.021 |
| 1050.6 | 0.02 |
| 1050.65 | 0.019 |
| 1050.7 | 0.019 |
| 1050.75 | 0.018 |
| 1050.8 | 0.018 |
| 1050.85 | 0.018 |
| 1050.9 | 0.018 |
| 1050.95 | 0.018 |
| 1051.0 | 0.017 |
| 1051.05 | 0.016 |
| 1051.1 | 0.017 |
| 1051.15 | 0.017 |
| 1051.2 | 0.018 |
| 1051.25 | 0.018 |
| 1051.3 | 0.019 |
| 1051.35 | 0.018 |
| 1051.4 | 0.019 |
| 1051.45 | 0.018 |
| 1051.5 | 0.018 |
| 1051.55 | 0.017 |
| 1051.6 | 0.018 |
| 1051.65 | 0.017 |
| 1051.7 | 0.017 |
| 1051.75 | 0.017 |
| 1051.8 | 0.016 |
| 1051.85 | 0.015 |
| 1051.9 | 0.016 |
| 1051.95 | 0.015 |
| 1052.0 | 0.015 |
| 1052.05 | 0.015 |
| 1052.1 | 0.016 |
| 1052.15 | 0.015 |
| 1052.2 | 0.016 |
| 1052.25 | 0.015 |
| 1052.3 | 0.015 |
| 1052.35 | 0.015 |
| 1052.4 | 0.015 |
| 1052.45 | 0.015 |
| 1052.5 | 0.017 |
| 1052.55 | 0.016 |
| 1052.6 | 0.017 |
| 1052.65 | 0.017 |
| 1052.7 | 0.018 |
| 1052.75 | 0.017 |
| 1052.8 | 0.017 |
| 1052.85 | 0.017 |
| 1052.9 | 0.016 |
| 1052.95 | 0.016 |
| 1053.0 | 0.016 |
| 1053.05 | 0.014 |
| 1053.1 | 0.013 |
| 1053.15 | 0.013 |
| 1053.2 | 0.013 |
| 1053.25 | 0.012 |
| 1053.3 | 0.013 |
| 1053.35 | 0.013 |
| 1053.4 | 0.012 |
| 1053.45 | 0.012 |
| 1053.5 | 0.013 |
| 1053.55 | 0.014 |
| 1053.6 | 0.014 |
| 1053.65 | 0.014 |
| 1053.7 | 0.013 |
| 1053.75 | 0.013 |
| 1053.8 | 0.013 |
| 1053.85 | 0.012 |
| 1053.9 | 0.013 |
| 1053.95 | 0.013 |
| 1054.0 | 0.014 |
| 1054.05 | 0.013 |
| 1054.1 | 0.013 |
| 1054.15 | 0.014 |
| 1054.2 | 0.013 |
| 1054.25 | 0.013 |
| 1054.3 | 0.013 |
| 1054.35 | 0.013 |
| 1054.4 | 0.012 |
| 1054.45 | 0.012 |
| 1054.5 | 0.013 |
| 1054.55 | 0.012 |
| 1054.6 | 0.012 |
| 1054.65 | 0.012 |
| 1054.7 | 0.01 |
| 1054.75 | 0.01 |
| 1054.8 | 0.01 |
| 1054.85 | 0.011 |
| 1054.9 | 0.011 |
| 1054.95 | 0.011 |
| 1055.0 | 0.011 |
| 1055.05 | 0.011 |
| 1055.1 | 0.011 |
| 1055.15 | 0.011 |
| 1055.2 | 0.011 |
| 1055.25 | 0.011 |
| 1055.3 | 0.011 |
| 1055.35 | 0.012 |
| 1055.4 | 0.011 |
| 1055.45 | 0.011 |
| 1055.5 | 0.011 |
| 1055.55 | 0.011 |
| 1055.6 | 0.012 |
| 1055.65 | 0.012 |
| 1055.7 | 0.012 |
| 1055.75 | 0.013 |
| 1055.8 | 0.013 |
| 1055.85 | 0.013 |
| 1055.9 | 0.013 |
| 1055.95 | 0.014 |
| 1056.0 | 0.014 |
| 1056.05 | 0.014 |
| 1056.1 | 0.015 |
| 1056.15 | 0.014 |
| 1056.2 | 0.014 |
| 1056.25 | 0.013 |
| 1056.3 | 0.013 |
| 1056.35 | 0.012 |
| 1056.4 | 0.012 |
| 1056.45 | 0.012 |
| 1056.5 | 0.012 |
| 1056.55 | 0.012 |
| 1056.6 | 0.012 |
| 1056.65 | 0.01 |
| 1056.7 | 0.01 |
| 1056.75 | 0.011 |
| 1056.8 | 0.011 |
| 1056.85 | 0.011 |
| 1056.9 | 0.012 |
| 1056.95 | 0.011 |
| 1057.0 | 0.011 |
| 1057.05 | 0.012 |
| 1057.1 | 0.012 |
| 1057.15 | 0.013 |
| 1057.2 | 0.013 |
| 1057.25 | 0.013 |
| 1057.3 | 0.012 |
| 1057.35 | 0.013 |
| 1057.4 | 0.015 |
| 1057.45 | 0.016 |
| 1057.5 | 0.017 |
| 1057.55 | 0.017 |
| 1057.6 | 0.015 |
| 1057.65 | 0.015 |
| 1057.7 | 0.015 |
| 1057.75 | 0.015 |
| 1057.8 | 0.016 |
| 1057.85 | 0.016 |
| 1057.9 | 0.014 |
| 1057.95 | 0.013 |
| 1058.0 | 0.012 |
| 1058.05 | 0.011 |
| 1058.1 | 0.01 |
| 1058.15 | 0.011 |
| 1058.2 | 0.012 |
| 1058.25 | 0.012 |
| 1058.3 | 0.012 |
| 1058.35 | 0.012 |
| 1058.4 | 0.012 |
| 1058.45 | 0.014 |
| 1058.5 | 0.014 |
| 1058.55 | 0.013 |
| 1058.6 | 0.013 |
| 1058.65 | 0.014 |
| 1058.7 | 0.014 |
| 1058.75 | 0.014 |
| 1058.8 | 0.013 |
| 1058.85 | 0.012 |
| 1058.9 | 0.013 |
| 1058.95 | 0.012 |
| 1059.0 | 0.013 |
| 1059.05 | 0.013 |
| 1059.1 | 0.014 |
| 1059.15 | 0.016 |
| 1059.2 | 0.015 |
| 1059.25 | 0.015 |
| 1059.3 | 0.015 |
| 1059.35 | 0.015 |
| 1059.4 | 0.015 |
| 1059.45 | 0.015 |
| 1059.5 | 0.014 |
| 1059.55 | 0.014 |
| 1059.6 | 0.015 |
| 1059.65 | 0.015 |
| 1059.7 | 0.016 |
| 1059.75 | 0.017 |
| 1059.8 | 0.016 |
| 1059.85 | 0.016 |
| 1059.9 | 0.016 |
| 1059.95 | 0.016 |
| 1060.0 | 0.017 |
| 1060.05 | 0.017 |
| 1060.1 | 0.018 |
| 1060.15 | 0.018 |
| 1060.2 | 0.018 |
| 1060.25 | 0.016 |
| 1060.3 | 0.015 |
| 1060.35 | 0.015 |
| 1060.4 | 0.016 |
| 1060.45 | 0.016 |
| 1060.5 | 0.016 |
| 1060.55 | 0.016 |
| 1060.6 | 0.016 |
| 1060.65 | 0.014 |
| 1060.7 | 0.014 |
| 1060.75 | 0.013 |
| 1060.8 | 0.013 |
| 1060.85 | 0.014 |
| 1060.9 | 0.014 |
| 1060.95 | 0.014 |
| 1061.0 | 0.014 |
| 1061.05 | 0.015 |
| 1061.1 | 0.015 |
| 1061.15 | 0.016 |
| 1061.2 | 0.016 |
| 1061.25 | 0.016 |
| 1061.3 | 0.016 |
| 1061.35 | 0.015 |
| 1061.4 | 0.015 |
| 1061.45 | 0.015 |
| 1061.5 | 0.015 |
| 1061.55 | 0.014 |
| 1061.6 | 0.012 |
| 1061.65 | 0.012 |
| 1061.7 | 0.012 |
| 1061.75 | 0.012 |
| 1061.8 | 0.012 |
| 1061.85 | 0.012 |
| 1061.9 | 0.013 |
| 1061.95 | 0.013 |
| 1062.0 | 0.014 |
| 1062.05 | 0.012 |
| 1062.1 | 0.013 |
| 1062.15 | 0.014 |
| 1062.2 | 0.014 |
| 1062.25 | 0.013 |
| 1062.3 | 0.013 |
| 1062.35 | 0.013 |
| 1062.4 | 0.013 |
| 1062.45 | 0.013 |
| 1062.5 | 0.011 |
| 1062.55 | 0.011 |
| 1062.6 | 0.012 |
| 1062.65 | 0.012 |
| 1062.7 | 0.014 |
| 1062.75 | 0.014 |
| 1062.8 | 0.014 |
| 1062.85 | 0.014 |
| 1062.9 | 0.015 |
| 1062.95 | 0.015 |
| 1063.0 | 0.015 |
| 1063.05 | 0.016 |
| 1063.1 | 0.017 |
| 1063.15 | 0.017 |
| 1063.2 | 0.015 |
| 1063.25 | 0.014 |
| 1063.3 | 0.014 |
| 1063.35 | 0.014 |
| 1063.4 | 0.015 |
| 1063.45 | 0.015 |
| 1063.5 | 0.015 |
| 1063.55 | 0.015 |
| 1063.6 | 0.016 |
| 1063.65 | 0.017 |
| 1063.7 | 0.017 |
| 1063.75 | 0.017 |
| 1063.8 | 0.017 |
| 1063.85 | 0.016 |
| 1063.9 | 0.017 |
| 1063.95 | 0.017 |
| 1064.0 | 0.016 |
| 1064.05 | 0.016 |
| 1064.1 | 0.017 |
| 1064.15 | 0.016 |
| 1064.2 | 0.014 |
| 1064.25 | 0.015 |
| 1064.3 | 0.014 |
| 1064.35 | 0.014 |
| 1064.4 | 0.015 |
| 1064.45 | 0.015 |
| 1064.5 | 0.015 |
| 1064.55 | 0.015 |
| 1064.6 | 0.015 |
| 1064.65 | 0.014 |
| 1064.7 | 0.013 |
| 1064.75 | 0.013 |
| 1064.8 | 0.013 |
| 1064.85 | 0.013 |
| 1064.9 | 0.014 |
| 1064.95 | 0.014 |
| 1065.0 | 0.013 |
| 1065.05 | 0.013 |
| 1065.1 | 0.012 |
| 1065.15 | 0.012 |
| 1065.2 | 0.013 |
| 1065.25 | 0.012 |
| 1065.3 | 0.012 |
| 1065.35 | 0.013 |
| 1065.4 | 0.012 |
| 1065.45 | 0.011 |
| 1065.5 | 0.011 |
| 1065.55 | 0.011 |
| 1065.6 | 0.012 |
| 1065.65 | 0.01 |
| 1065.7 | 0.011 |
| 1065.75 | 0.012 |
| 1065.8 | 0.012 |
| 1065.85 | 0.012 |
| 1065.9 | 0.012 |
| 1065.95 | 0.013 |
| 1066.0 | 0.013 |
| 1066.05 | 0.012 |
| 1066.1 | 0.013 |
| 1066.15 | 0.013 |
| 1066.2 | 0.014 |
| 1066.25 | 0.013 |
| 1066.3 | 0.012 |
| 1066.35 | 0.012 |
| 1066.4 | 0.012 |
| 1066.45 | 0.012 |
| 1066.5 | 0.012 |
| 1066.55 | 0.012 |
| 1066.6 | 0.013 |
| 1066.65 | 0.013 |
| 1066.7 | 0.012 |
| 1066.75 | 0.012 |
| 1066.8 | 0.013 |
| 1066.85 | 0.012 |
| 1066.9 | 0.013 |
| 1066.95 | 0.012 |
| 1067.0 | 0.012 |
| 1067.05 | 0.011 |
| 1067.1 | 0.011 |
| 1067.15 | 0.012 |
| 1067.2 | 0.012 |
| 1067.25 | 0.013 |
| 1067.3 | 0.013 |
| 1067.35 | 0.012 |
| 1067.4 | 0.012 |
| 1067.45 | 0.012 |
| 1067.5 | 0.013 |
| 1067.55 | 0.012 |
| 1067.6 | 0.013 |
| 1067.65 | 0.012 |
| 1067.7 | 0.011 |
| 1067.75 | 0.01 |
| 1067.8 | 0.01 |
| 1067.85 | 0.009 |
| 1067.9 | 0.009 |
| 1067.95 | 0.01 |
| 1068.0 | 0.009 |
| 1068.05 | 0.009 |
| 1068.1 | 0.009 |
| 1068.15 | 0.008 |
| 1068.2 | 0.008 |
| 1068.25 | 0.007 |
| 1068.3 | 0.008 |
| 1068.35 | 0.007 |
| 1068.4 | 0.008 |
| 1068.45 | 0.009 |
| 1068.5 | 0.007 |
| 1068.55 | 0.008 |
| 1068.6 | 0.008 |
| 1068.65 | 0.008 |
| 1068.7 | 0.008 |
| 1068.75 | 0.008 |
| 1068.8 | 0.009 |
| 1068.85 | 0.009 |
| 1068.9 | 0.009 |
| 1068.95 | 0.009 |
| 1069.0 | 0.008 |
| 1069.05 | 0.008 |
| 1069.1 | 0.007 |
| 1069.15 | 0.007 |
| 1069.2 | 0.006 |
| 1069.25 | 0.006 |
| 1069.3 | 0.007 |
| 1069.35 | 0.006 |
| 1069.4 | 0.008 |
| 1069.45 | 0.007 |
| 1069.5 | 0.007 |
| 1069.55 | 0.008 |
| 1069.6 | 0.009 |
| 1069.65 | 0.01 |
| 1069.7 | 0.011 |
| 1069.75 | 0.012 |
| 1069.8 | 0.012 |
| 1069.85 | 0.011 |
| 1069.9 | 0.011 |
| 1069.95 | 0.011 |
| 1070.0 | 0.012 |
| 1070.05 | 0.012 |
| 1070.1 | 0.011 |
| 1070.15 | 0.011 |
| 1070.2 | 0.01 |
| 1070.25 | 0.009 |
| 1070.3 | 0.01 |
| 1070.35 | 0.01 |
| 1070.4 | 0.01 |
| 1070.45 | 0.012 |
| 1070.5 | 0.01 |
| 1070.55 | 0.009 |
| 1070.6 | 0.008 |
| 1070.65 | 0.009 |
| 1070.7 | 0.009 |
| 1070.75 | 0.009 |
| 1070.8 | 0.009 |
| 1070.85 | 0.009 |
| 1070.9 | 0.009 |
| 1070.95 | 0.009 |
| 1071.0 | 0.008 |
| 1071.05 | 0.008 |
| 1071.1 | 0.009 |
| 1071.15 | 0.009 |
| 1071.2 | 0.009 |
| 1071.25 | 0.009 |
| 1071.3 | 0.01 |
| 1071.35 | 0.009 |
| 1071.4 | 0.009 |
| 1071.45 | 0.009 |
| 1071.5 | 0.008 |
| 1071.55 | 0.008 |
| 1071.6 | 0.008 |
| 1071.65 | 0.007 |
| 1071.7 | 0.007 |
| 1071.75 | 0.007 |
| 1071.8 | 0.007 |
| 1071.85 | 0.006 |
| 1071.9 | 0.007 |
| 1071.95 | 0.008 |
| 1072.0 | 0.007 |
| 1072.05 | 0.006 |
| 1072.1 | 0.007 |
| 1072.15 | 0.007 |
| 1072.2 | 0.007 |
| 1072.25 | 0.007 |
| 1072.3 | 0.007 |
| 1072.35 | 0.007 |
| 1072.4 | 0.007 |
| 1072.45 | 0.006 |
| 1072.5 | 0.006 |
| 1072.55 | 0.006 |
| 1072.6 | 0.006 |
| 1072.65 | 0.005 |
| 1072.7 | 0.005 |
| 1072.75 | 0.005 |
| 1072.8 | 0.005 |
| 1072.85 | 0.004 |
| 1072.9 | 0.004 |
| 1072.95 | 0.004 |
| 1073.0 | 0.004 |
| 1073.05 | 0.004 |
| 1073.1 | 0.005 |
| 1073.15 | 0.005 |
| 1073.2 | 0.005 |
| 1073.25 | 0.004 |
| 1073.3 | 0.005 |
| 1073.35 | 0.004 |
| 1073.4 | 0.005 |
| 1073.45 | 0.005 |
| 1073.5 | 0.004 |
| 1073.55 | 0.003 |
| 1073.6 | 0.003 |
| 1073.65 | 0.003 |
| 1073.7 | 0.003 |
| 1073.75 | 0.002 |
| 1073.8 | 0.003 |
| 1073.85 | 0.003 |
| 1073.9 | 0.003 |
| 1073.95 | 0.003 |
| 1074.0 | 0.003 |
| 1074.05 | 0.005 |
| 1074.1 | 0.005 |
| 1074.15 | 0.004 |
| 1074.2 | 0.004 |
| 1074.25 | 0.004 |
| 1074.3 | 0.004 |
| 1074.35 | 0.004 |
| 1074.4 | 0.004 |
| 1074.45 | 0.005 |
| 1074.5 | 0.004 |
| 1074.55 | 0.004 |
| 1074.6 | 0.003 |
| 1074.65 | 0.003 |
| 1074.7 | 0.002 |
| 1074.75 | 0.003 |
| 1074.8 | 0.002 |
| 1074.85 | 0.002 |
| 1074.9 | 0.001 |
| 1074.95 | 0.001 |
| 1075.0 | -0.001 |
| 1075.05 | 0 |
| 1075.1 | 0 |
| 1075.15 | 0 |
| 1075.2 | 0.001 |
| 1075.25 | 0.002 |
| 1075.3 | 0.002 |
| 1075.35 | 0.002 |
| 1075.4 | 0.002 |
| 1075.45 | 0.002 |
| 1075.5 | 0.002 |
| 1075.55 | 0.003 |
| 1075.6 | 0.002 |
| 1075.65 | 0.002 |
| 1075.7 | 0.002 |
| 1075.75 | 0.002 |
| 1075.8 | 0.001 |
| 1075.85 | 0.001 |
| 1075.9 | 0.002 |
| 1075.95 | 0.002 |
| 1076.0 | 0.002 |
| 1076.05 | 0.002 |
| 1076.1 | 0.001 |
| 1076.15 | 0.002 |
| 1076.2 | 0.003 |
| 1076.25 | 0.003 |
| 1076.3 | 0.003 |
| 1076.35 | 0.002 |
| 1076.4 | 0.003 |
| 1076.45 | 0.003 |
| 1076.5 | 0.004 |
| 1076.55 | 0.004 |
| 1076.6 | 0.004 |
| 1076.65 | 0.005 |
| 1076.7 | 0.005 |
| 1076.75 | 0.005 |
| 1076.8 | 0.004 |
| 1076.85 | 0.003 |
| 1076.9 | 0.003 |
| 1076.95 | 0.003 |
| 1077.0 | 0.002 |
| 1077.05 | 0.001 |
| 1077.1 | 0.002 |
| 1077.15 | 0.002 |
| 1077.2 | 0.002 |
| 1077.25 | 0.002 |
| 1077.3 | 0.002 |
| 1077.35 | 0.003 |
| 1077.4 | 0.003 |
| 1077.45 | 0.003 |
| 1077.5 | 0.003 |
| 1077.55 | 0.002 |
| 1077.6 | 0.001 |
| 1077.65 | 0.001 |
| 1077.7 | 0.001 |
| 1077.75 | 0 |
| 1077.8 | 0 |
| 1077.85 | 0 |
| 1077.9 | 0 |
| 1077.95 | 0 |
| 1078.0 | -0.001 |
| 1078.05 | -0.001 |
| 1078.1 | 0 |
| 1078.15 | 0.001 |
| 1078.2 | 0.001 |
| 1078.25 | -0.001 |
| 1078.3 | -0.001 |
| 1078.35 | -0.001 |
| 1078.4 | -0.001 |
| 1078.45 | -0.001 |
| 1078.5 | -0.001 |
| 1078.55 | -0.002 |
| 1078.6 | -0.002 |
| 1078.65 | -0.002 |
| 1078.7 | -0.002 |
| 1078.75 | -0.003 |
| 1078.8 | -0.002 |
| 1078.85 | -0.001 |
| 1078.9 | -0.001 |
| 1078.95 | -0.002 |
| 1079.0 | -0.002 |
| 1079.05 | -0.003 |
| 1079.1 | -0.002 |
| 1079.15 | -0.001 |
| 1079.2 | -0.001 |
| 1079.25 | -0.001 |
| 1079.3 | -0.001 |
| 1079.35 | -0.001 |
| 1079.4 | -0.003 |
| 1079.45 | -0.002 |
| 1079.5 | -0.002 |
| 1079.55 | -0.002 |
| 1079.6 | -0.002 |
| 1079.65 | -0.002 |
| 1079.7 | -0.003 |
| 1079.75 | -0.003 |
| 1079.8 | -0.003 |
| 1079.85 | -0.003 |
| 1079.9 | -0.004 |
| 1079.95 | -0.003 |
| 1080.0 | -0.003 |
| 1080.05 | -0.003 |
| 1080.1 | -0.004 |
| 1080.15 | -0.004 |
| 1080.2 | -0.004 |
| 1080.25 | -0.004 |
| 1080.3 | -0.004 |
| 1080.35 | -0.003 |
| 1080.4 | -0.003 |
| 1080.45 | -0.002 |
| 1080.5 | -0.002 |
| 1080.55 | -0.001 |
| 1080.6 | -0.002 |
| 1080.65 | -0.001 |
| 1080.7 | -0.001 |
| 1080.75 | -0.001 |
| 1080.8 | -0.001 |
| 1080.85 | -0.001 |
| 1080.9 | -0.002 |
| 1080.95 | -0.003 |
| 1081.0 | -0.004 |
| 1081.05 | -0.004 |
| 1081.1 | -0.005 |
| 1081.15 | -0.004 |
| 1081.2 | -0.004 |
| 1081.25 | -0.003 |
| 1081.3 | -0.004 |
| 1081.35 | -0.004 |
| 1081.4 | -0.004 |
| 1081.45 | -0.003 |
| 1081.5 | -0.002 |
| 1081.55 | -0.003 |
| 1081.6 | -0.002 |
| 1081.65 | -0.002 |
| 1081.7 | -0.002 |
| 1081.75 | -0.001 |
| 1081.8 | -0.002 |
| 1081.85 | 0 |
| 1081.9 | -0.001 |
| 1081.95 | -0.001 |
| 1082.0 | 0.001 |
| 1082.05 | -0.001 |
| 1082.1 | 0 |
| 1082.15 | 0 |
| 1082.2 | 0.001 |
| 1082.25 | 0 |
| 1082.3 | 0 |
| 1082.35 | 0.001 |
| 1082.4 | 0 |
| 1082.45 | 0.001 |
| 1082.5 | 0.001 |
| 1082.55 | 0 |
| 1082.6 | 0.001 |
| 1082.65 | 0 |
| 1082.7 | -0.002 |
| 1082.75 | -0.002 |
| 1082.8 | -0.002 |
| 1082.85 | -0.003 |
| 1082.9 | -0.002 |
| 1082.95 | -0.002 |
| 1083.0 | -0.003 |
| 1083.05 | -0.004 |
| 1083.1 | -0.003 |
| 1083.15 | -0.002 |
| 1083.2 | -0.002 |
| 1083.25 | 0 |
| 1083.3 | 0 |
| 1083.35 | 0 |
| 1083.4 | 0.001 |
| 1083.45 | 0.001 |
| 1083.5 | 0 |
| 1083.55 | 0.001 |
| 1083.6 | 0.001 |
| 1083.65 | 0.001 |
| 1083.7 | 0 |
| 1083.75 | -0.001 |
| 1083.8 | -0.001 |
| 1083.85 | -0.001 |
| 1083.9 | -0.001 |
| 1083.95 | -0.002 |
| 1084.0 | -0.001 |
| 1084.05 | -0.001 |
| 1084.1 | -0.002 |
| 1084.15 | -0.001 |
| 1084.2 | 0 |
| 1084.25 | -0.001 |
| 1084.3 | 0 |
| 1084.35 | 0 |
| 1084.4 | 0 |
| 1084.45 | 0.001 |
| 1084.5 | 0.001 |
| 1084.55 | 0.001 |
| 1084.6 | 0.001 |
| 1084.65 | 0 |
| 1084.7 | 0.001 |
| 1084.75 | 0 |
| 1084.8 | 0.001 |
| 1084.85 | 0 |
| 1084.9 | 0 |
| 1084.95 | 0 |
| 1085.0 | -0.001 |
| 1085.05 | -0.002 |
| 1085.1 | -0.002 |
| 1085.15 | -0.002 |
| 1085.2 | -0.001 |
| 1085.25 | -0.002 |
| 1085.3 | -0.003 |
| 1085.35 | -0.003 |
| 1085.4 | -0.004 |
| 1085.45 | -0.004 |
| 1085.5 | -0.004 |
| 1085.55 | -0.004 |
| 1085.6 | -0.005 |
| 1085.65 | -0.004 |
| 1085.7 | -0.004 |
| 1085.75 | -0.004 |
| 1085.8 | -0.003 |
| 1085.85 | -0.002 |
| 1085.9 | -0.002 |
| 1085.95 | -0.002 |
| 1086.0 | -0.001 |
| 1086.05 | -0.002 |
| 1086.1 | -0.002 |
| 1086.15 | -0.001 |
| 1086.2 | -0.002 |
| 1086.25 | -0.001 |
| 1086.3 | -0.002 |
| 1086.35 | -0.002 |
| 1086.4 | -0.003 |
| 1086.45 | -0.003 |
| 1086.5 | -0.003 |
| 1086.55 | -0.003 |
| 1086.6 | -0.002 |
| 1086.65 | -0.001 |
| 1086.7 | -0.001 |
| 1086.75 | -0.001 |
| 1086.8 | -0.002 |
| 1086.85 | -0.001 |
| 1086.9 | 0 |
| 1086.95 | 0 |
| 1087.0 | 0 |
| 1087.05 | 0.001 |
| 1087.1 | 0.001 |
| 1087.15 | 0 |
| 1087.2 | -0.001 |
| 1087.25 | -0.001 |
| 1087.3 | 0 |
| 1087.35 | 0 |
| 1087.4 | -0.001 |
| 1087.45 | -0.001 |
| 1087.5 | -0.002 |
| 1087.55 | -0.001 |
| 1087.6 | -0.002 |
| 1087.65 | -0.002 |
| 1087.7 | -0.002 |
| 1087.75 | -0.002 |
| 1087.8 | -0.003 |
| 1087.85 | -0.003 |
| 1087.9 | -0.003 |
| 1087.95 | -0.002 |
| 1088.0 | -0.001 |
| 1088.05 | -0.001 |
| 1088.1 | -0.001 |
| 1088.15 | -0.001 |
| 1088.2 | -0.002 |
| 1088.25 | -0.002 |
| 1088.3 | -0.001 |
| 1088.35 | -0.001 |
| 1088.4 | -0.001 |
| 1088.45 | -0.001 |
| 1088.5 | -0.001 |
| 1088.55 | -0.002 |
| 1088.6 | -0.002 |
| 1088.65 | -0.003 |
| 1088.7 | -0.003 |
| 1088.75 | -0.002 |
| 1088.8 | -0.003 |
| 1088.85 | -0.003 |
| 1088.9 | -0.003 |
| 1088.95 | -0.003 |
| 1089.0 | -0.002 |
| 1089.05 | -0.002 |
| 1089.1 | -0.002 |
| 1089.15 | -0.002 |
| 1089.2 | -0.001 |
| 1089.25 | -0.001 |
| 1089.3 | -0.001 |
| 1089.35 | 0 |
| 1089.4 | 0 |
| 1089.45 | 0.001 |
| 1089.5 | 0.001 |
| 1089.55 | 0.002 |
| 1089.6 | 0.002 |
| 1089.65 | 0.002 |
| 1089.7 | 0.003 |
| 1089.75 | 0.003 |
| 1089.8 | 0.004 |
| 1089.85 | 0.004 |
| 1089.9 | 0.003 |
| 1089.95 | 0.003 |
| 1090.0 | 0.003 |
| 1090.05 | 0.003 |
| 1090.1 | 0.003 |
| 1090.15 | 0.002 |
| 1090.2 | 0.002 |
| 1090.25 | 0.001 |
| 1090.3 | 0 |
| 1090.35 | 0 |
| 1090.4 | 0 |
| 1090.45 | -0.001 |
| 1090.5 | -0.001 |
| 1090.55 | -0.001 |
| 1090.6 | -0.002 |
| 1090.65 | -0.003 |
| 1090.7 | -0.003 |
| 1090.75 | -0.002 |
| 1090.8 | -0.002 |
| 1090.85 | -0.003 |
| 1090.9 | -0.003 |
| 1090.95 | -0.003 |
| 1091.0 | -0.002 |
| 1091.05 | -0.002 |
| 1091.1 | -0.002 |
| 1091.15 | -0.002 |
| 1091.2 | -0.003 |
| 1091.25 | -0.002 |
| 1091.3 | -0.002 |
| 1091.35 | -0.002 |
| 1091.4 | -0.002 |
| 1091.45 | -0.001 |
| 1091.5 | -0.001 |
| 1091.55 | -0.002 |
| 1091.6 | -0.002 |
| 1091.65 | -0.001 |
| 1091.7 | -0.001 |
| 1091.75 | -0.001 |
| 1091.8 | -0.002 |
| 1091.85 | -0.002 |
| 1091.9 | -0.003 |
| 1091.95 | -0.003 |
| 1092.0 | -0.005 |
| 1092.05 | -0.006 |
| 1092.1 | -0.006 |
| 1092.15 | -0.007 |
| 1092.2 | -0.007 |
| 1092.25 | -0.007 |
| 1092.3 | -0.007 |
| 1092.35 | -0.006 |
| 1092.4 | -0.007 |
| 1092.45 | -0.007 |
| 1092.5 | -0.007 |
| 1092.55 | -0.007 |
| 1092.6 | -0.007 |
| 1092.65 | -0.007 |
| 1092.7 | -0.006 |
| 1092.75 | -0.007 |
| 1092.8 | -0.007 |
| 1092.85 | -0.006 |
| 1092.9 | -0.006 |
| 1092.95 | -0.006 |
| 1093.0 | -0.006 |
| 1093.05 | -0.006 |
| 1093.1 | -0.005 |
| 1093.15 | -0.005 |
| 1093.2 | -0.006 |
| 1093.25 | -0.007 |
| 1093.3 | -0.007 |
| 1093.35 | -0.007 |
| 1093.4 | -0.007 |
| 1093.45 | -0.007 |
| 1093.5 | -0.007 |
| 1093.55 | -0.008 |
| 1093.6 | -0.008 |
| 1093.65 | -0.008 |
| 1093.7 | -0.008 |
| 1093.75 | -0.007 |
| 1093.8 | -0.005 |
| 1093.85 | -0.005 |
| 1093.9 | -0.005 |
| 1093.95 | -0.005 |
| 1094.0 | -0.006 |
| 1094.05 | -0.006 |
| 1094.1 | -0.004 |
| 1094.15 | -0.004 |
| 1094.2 | -0.005 |
| 1094.25 | -0.005 |
| 1094.3 | -0.005 |
| 1094.35 | -0.006 |
| 1094.4 | -0.004 |
| 1094.45 | -0.006 |
| 1094.5 | -0.006 |
| 1094.55 | -0.005 |
| 1094.6 | -0.006 |
| 1094.65 | -0.008 |
| 1094.7 | -0.009 |
| 1094.75 | -0.008 |
| 1094.8 | -0.008 |
| 1094.85 | -0.007 |
| 1094.9 | -0.007 |
| 1094.95 | -0.009 |
| 1095.0 | -0.008 |
| 1095.05 | -0.008 |
| 1095.1 | -0.009 |
| 1095.15 | -0.009 |
| 1095.2 | -0.008 |
| 1095.25 | -0.009 |
| 1095.3 | -0.009 |
| 1095.35 | -0.009 |
| 1095.4 | -0.01 |
| 1095.45 | -0.01 |
| 1095.5 | -0.01 |
| 1095.55 | -0.01 |
| 1095.6 | -0.01 |
| 1095.65 | -0.008 |
| 1095.7 | -0.008 |
| 1095.75 | -0.007 |
| 1095.8 | -0.007 |
| 1095.85 | -0.008 |
| 1095.9 | -0.009 |
| 1095.95 | -0.01 |
| 1096.0 | -0.01 |
| 1096.05 | -0.01 |
| 1096.1 | -0.009 |
| 1096.15 | -0.01 |
| 1096.2 | -0.011 |
| 1096.25 | -0.011 |
| 1096.3 | -0.012 |
| 1096.35 | -0.012 |
| 1096.4 | -0.012 |
| 1096.45 | -0.012 |
| 1096.5 | -0.013 |
| 1096.55 | -0.013 |
| 1096.6 | -0.014 |
| 1096.65 | -0.014 |
| 1096.7 | -0.016 |
| 1096.75 | -0.015 |
| 1096.8 | -0.016 |
| 1096.85 | -0.015 |
| 1096.9 | -0.015 |
| 1096.95 | -0.015 |
| 1097.0 | -0.015 |
| 1097.05 | -0.014 |
| 1097.1 | -0.014 |
| 1097.15 | -0.013 |
| 1097.2 | -0.012 |
| 1097.25 | -0.011 |
| 1097.3 | -0.012 |
| 1097.35 | -0.011 |
| 1097.4 | -0.012 |
| 1097.45 | -0.012 |
| 1097.5 | -0.011 |
| 1097.55 | -0.01 |
| 1097.6 | -0.01 |
| 1097.65 | -0.011 |
| 1097.7 | -0.012 |
| 1097.75 | -0.013 |
| 1097.8 | -0.013 |
| 1097.85 | -0.012 |
| 1097.9 | -0.012 |
| 1097.95 | -0.012 |
| 1098.0 | -0.012 |
| 1098.05 | -0.013 |
| 1098.1 | -0.012 |
| 1098.15 | -0.012 |
| 1098.2 | -0.011 |
| 1098.25 | -0.011 |
| 1098.3 | -0.01 |
| 1098.35 | -0.01 |
| 1098.4 | -0.011 |
| 1098.45 | -0.011 |
| 1098.5 | -0.01 |
| 1098.55 | -0.01 |
| 1098.6 | -0.009 |
| 1098.65 | -0.01 |
| 1098.7 | -0.011 |
| 1098.75 | -0.01 |
| 1098.8 | -0.01 |
| 1098.85 | -0.01 |
| 1098.9 | -0.009 |
| 1098.95 | -0.009 |
| 1099.0 | -0.009 |
| 1099.05 | -0.008 |
| 1099.1 | -0.007 |
| 1099.15 | -0.008 |
| 1099.2 | -0.007 |
| 1099.25 | -0.005 |
| 1099.3 | -0.006 |
| 1099.35 | -0.006 |
| 1099.4 | -0.005 |
| 1099.45 | -0.005 |
| 1099.5 | -0.005 |
| 1099.55 | -0.005 |
| 1099.6 | -0.007 |
| 1099.65 | -0.007 |
| 1099.7 | -0.006 |
| 1099.75 | -0.006 |
| 1099.8 | -0.006 |
| 1099.85 | -0.005 |
| 1099.9 | -0.004 |
| 1099.95 | -0.004 |
| 1100.0 | -0.003 |